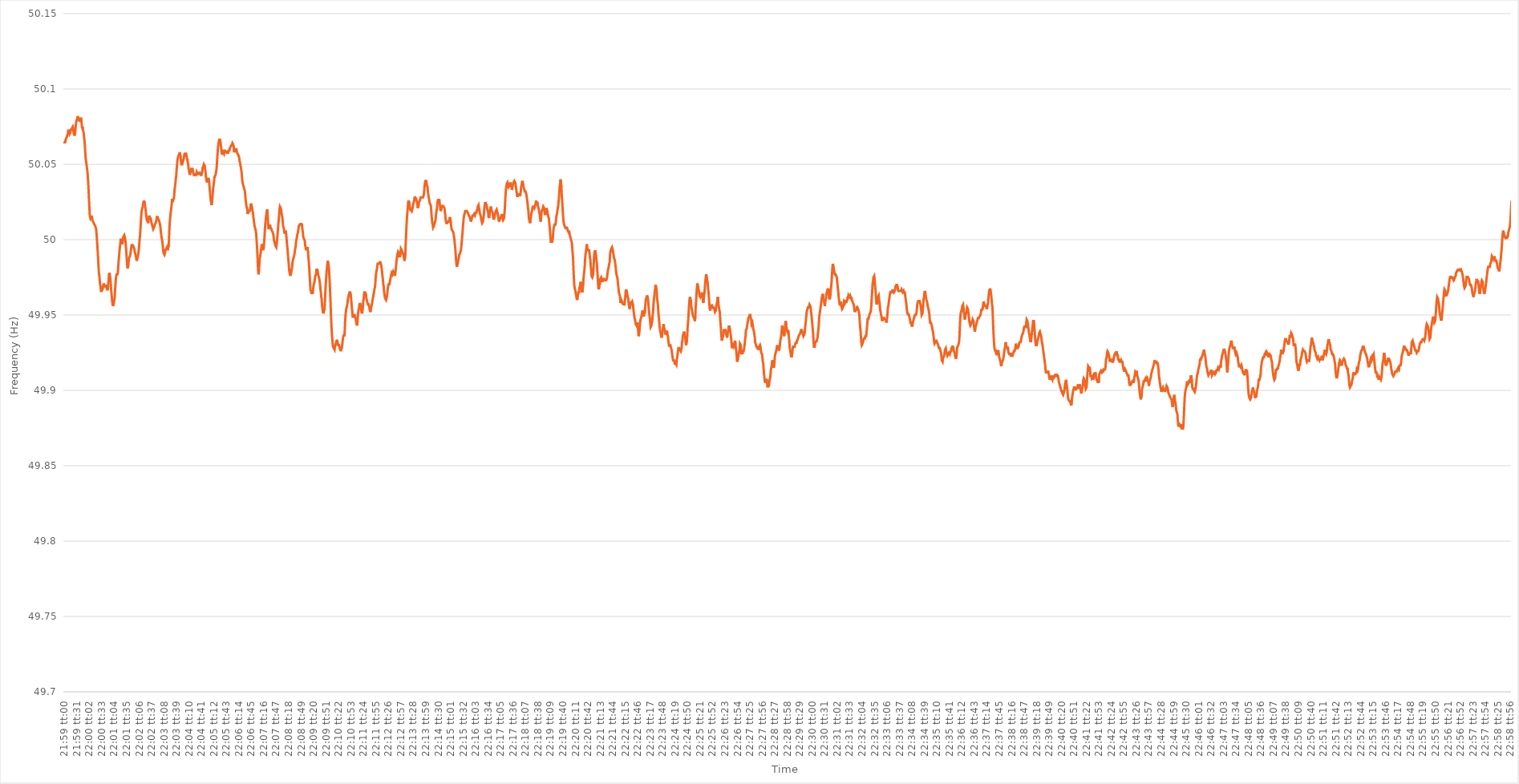
| Category | Series 0 |
|---|---|
| 0.9159722222222223 | 50.065 |
| 0.9159837962962962 | 50.064 |
| 0.9159953703703704 | 50.064 |
| 0.9160069444444444 | 50.066 |
| 0.9160185185185186 | 50.067 |
| 0.9160300925925925 | 50.067 |
| 0.9160416666666666 | 50.068 |
| 0.9160532407407408 | 50.069 |
| 0.9160648148148148 | 50.07 |
| 0.9160763888888889 | 50.071 |
| 0.9160879629629629 | 50.073 |
| 0.9160995370370371 | 50.07 |
| 0.9161111111111112 | 50.071 |
| 0.9161226851851851 | 50.07 |
| 0.9161342592592593 | 50.07 |
| 0.9161458333333333 | 50.071 |
| 0.9161574074074075 | 50.073 |
| 0.9161689814814814 | 50.073 |
| 0.9161805555555556 | 50.073 |
| 0.9161921296296297 | 50.074 |
| 0.9162037037037036 | 50.074 |
| 0.9162152777777778 | 50.075 |
| 0.9162268518518518 | 50.074 |
| 0.916238425925926 | 50.071 |
| 0.9162499999999999 | 50.07 |
| 0.916261574074074 | 50.069 |
| 0.9162731481481482 | 50.069 |
| 0.9162847222222222 | 50.071 |
| 0.9162962962962963 | 50.075 |
| 0.9163078703703703 | 50.077 |
| 0.9163194444444445 | 50.079 |
| 0.9163310185185186 | 50.079 |
| 0.9163425925925925 | 50.08 |
| 0.9163541666666667 | 50.082 |
| 0.9163657407407407 | 50.081 |
| 0.9163773148148149 | 50.08 |
| 0.9163888888888888 | 50.08 |
| 0.916400462962963 | 50.079 |
| 0.9164120370370371 | 50.079 |
| 0.916423611111111 | 50.079 |
| 0.9164351851851852 | 50.08 |
| 0.9164467592592592 | 50.081 |
| 0.9164583333333334 | 50.08 |
| 0.9164699074074073 | 50.077 |
| 0.9164814814814815 | 50.074 |
| 0.9164930555555556 | 50.075 |
| 0.9165046296296296 | 50.073 |
| 0.9165162037037037 | 50.072 |
| 0.9165277777777777 | 50.071 |
| 0.9165393518518519 | 50.068 |
| 0.916550925925926 | 50.066 |
| 0.9165625 | 50.062 |
| 0.9165740740740741 | 50.058 |
| 0.9165856481481481 | 50.054 |
| 0.9165972222222223 | 50.052 |
| 0.9166087962962962 | 50.05 |
| 0.9166203703703704 | 50.048 |
| 0.9166319444444445 | 50.046 |
| 0.9166435185185186 | 50.043 |
| 0.9166550925925926 | 50.039 |
| 0.9166666666666666 | 50.034 |
| 0.9166782407407408 | 50.028 |
| 0.9166898148148147 | 50.023 |
| 0.9167013888888889 | 50.017 |
| 0.916712962962963 | 50.015 |
| 0.916724537037037 | 50.014 |
| 0.9167361111111111 | 50.014 |
| 0.9167476851851851 | 50.015 |
| 0.9167592592592593 | 50.016 |
| 0.9167708333333334 | 50.014 |
| 0.9167824074074074 | 50.013 |
| 0.9167939814814815 | 50.012 |
| 0.9168055555555555 | 50.012 |
| 0.9168171296296297 | 50.011 |
| 0.9168287037037036 | 50.011 |
| 0.9168402777777778 | 50.01 |
| 0.9168518518518519 | 50.01 |
| 0.916863425925926 | 50.009 |
| 0.916875 | 50.008 |
| 0.916886574074074 | 50.007 |
| 0.9168981481481482 | 50.004 |
| 0.9169097222222221 | 50 |
| 0.9169212962962963 | 49.996 |
| 0.9169328703703704 | 49.992 |
| 0.9169444444444445 | 49.987 |
| 0.9169560185185185 | 49.982 |
| 0.9169675925925925 | 49.978 |
| 0.9169791666666667 | 49.976 |
| 0.9169907407407408 | 49.973 |
| 0.9170023148148148 | 49.97 |
| 0.9170138888888889 | 49.969 |
| 0.917025462962963 | 49.966 |
| 0.9170370370370371 | 49.966 |
| 0.917048611111111 | 49.966 |
| 0.9170601851851852 | 49.966 |
| 0.9170717592592593 | 49.967 |
| 0.9170833333333334 | 49.969 |
| 0.9170949074074074 | 49.97 |
| 0.9171064814814814 | 49.971 |
| 0.9171180555555556 | 49.97 |
| 0.9171296296296297 | 49.969 |
| 0.9171412037037037 | 49.969 |
| 0.9171527777777778 | 49.969 |
| 0.9171643518518519 | 49.97 |
| 0.9171759259259259 | 49.969 |
| 0.9171874999999999 | 49.968 |
| 0.9171990740740741 | 49.967 |
| 0.9172106481481482 | 49.967 |
| 0.9172222222222222 | 49.967 |
| 0.9172337962962963 | 49.97 |
| 0.9172453703703703 | 49.973 |
| 0.9172569444444445 | 49.977 |
| 0.9172685185185184 | 49.978 |
| 0.9172800925925926 | 49.977 |
| 0.9172916666666667 | 49.975 |
| 0.9173032407407408 | 49.972 |
| 0.9173148148148148 | 49.968 |
| 0.9173263888888888 | 49.965 |
| 0.917337962962963 | 49.962 |
| 0.9173495370370371 | 49.959 |
| 0.9173611111111111 | 49.957 |
| 0.9173726851851852 | 49.956 |
| 0.9173842592592593 | 49.956 |
| 0.9173958333333333 | 49.958 |
| 0.9174074074074073 | 49.96 |
| 0.9174189814814815 | 49.961 |
| 0.9174305555555556 | 49.966 |
| 0.9174421296296296 | 49.97 |
| 0.9174537037037037 | 49.974 |
| 0.9174652777777778 | 49.976 |
| 0.9174768518518519 | 49.977 |
| 0.9174884259259258 | 49.977 |
| 0.9175 | 49.977 |
| 0.9175115740740741 | 49.978 |
| 0.9175231481481482 | 49.982 |
| 0.9175347222222222 | 49.986 |
| 0.9175462962962962 | 49.989 |
| 0.9175578703703704 | 49.992 |
| 0.9175694444444445 | 49.995 |
| 0.9175810185185185 | 49.997 |
| 0.9175925925925926 | 50 |
| 0.9176041666666667 | 50 |
| 0.9176157407407407 | 50 |
| 0.9176273148148147 | 49.998 |
| 0.9176388888888889 | 49.997 |
| 0.917650462962963 | 49.997 |
| 0.917662037037037 | 50.001 |
| 0.9176736111111111 | 50.002 |
| 0.9176851851851852 | 50.002 |
| 0.9176967592592593 | 50.003 |
| 0.9177083333333332 | 50.002 |
| 0.9177199074074074 | 50.001 |
| 0.9177314814814815 | 49.999 |
| 0.9177430555555556 | 49.996 |
| 0.9177546296296296 | 49.992 |
| 0.9177662037037037 | 49.988 |
| 0.9177777777777778 | 49.984 |
| 0.917789351851852 | 49.981 |
| 0.9178009259259259 | 49.981 |
| 0.9178125 | 49.983 |
| 0.9178240740740741 | 49.986 |
| 0.9178356481481482 | 49.988 |
| 0.9178472222222221 | 49.988 |
| 0.9178587962962963 | 49.989 |
| 0.9178703703703704 | 49.99 |
| 0.9178819444444444 | 49.992 |
| 0.9178935185185185 | 49.994 |
| 0.9179050925925926 | 49.996 |
| 0.9179166666666667 | 49.997 |
| 0.9179282407407406 | 49.996 |
| 0.9179398148148148 | 49.996 |
| 0.9179513888888889 | 49.996 |
| 0.917962962962963 | 49.995 |
| 0.917974537037037 | 49.995 |
| 0.9179861111111111 | 49.994 |
| 0.9179976851851852 | 49.992 |
| 0.9180092592592594 | 49.991 |
| 0.9180208333333333 | 49.99 |
| 0.9180324074074074 | 49.989 |
| 0.9180439814814815 | 49.987 |
| 0.9180555555555556 | 49.986 |
| 0.9180671296296296 | 49.987 |
| 0.9180787037037037 | 49.988 |
| 0.9180902777777779 | 49.989 |
| 0.9181018518518518 | 49.991 |
| 0.9181134259259259 | 49.993 |
| 0.918125 | 49.996 |
| 0.9181365740740741 | 50 |
| 0.918148148148148 | 50.002 |
| 0.9181597222222222 | 50.006 |
| 0.9181712962962963 | 50.011 |
| 0.9181828703703704 | 50.015 |
| 0.9181944444444444 | 50.019 |
| 0.9182060185185185 | 50.02 |
| 0.9182175925925926 | 50.02 |
| 0.9182291666666668 | 50.022 |
| 0.9182407407407407 | 50.024 |
| 0.9182523148148148 | 50.025 |
| 0.9182638888888889 | 50.026 |
| 0.918275462962963 | 50.026 |
| 0.918287037037037 | 50.024 |
| 0.9182986111111111 | 50.022 |
| 0.9183101851851853 | 50.02 |
| 0.9183217592592593 | 50.017 |
| 0.9183333333333333 | 50.015 |
| 0.9183449074074074 | 50.013 |
| 0.9183564814814815 | 50.013 |
| 0.9183680555555555 | 50.012 |
| 0.9183796296296296 | 50.011 |
| 0.9183912037037038 | 50.012 |
| 0.9184027777777778 | 50.014 |
| 0.9184143518518518 | 50.016 |
| 0.9184259259259259 | 50.016 |
| 0.9184375 | 50.014 |
| 0.9184490740740742 | 50.014 |
| 0.9184606481481481 | 50.014 |
| 0.9184722222222222 | 50.012 |
| 0.9184837962962963 | 50.011 |
| 0.9184953703703704 | 50.011 |
| 0.9185069444444444 | 50.009 |
| 0.9185185185185185 | 50.009 |
| 0.9185300925925927 | 50.007 |
| 0.9185416666666667 | 50.007 |
| 0.9185532407407407 | 50.008 |
| 0.9185648148148148 | 50.009 |
| 0.9185763888888889 | 50.01 |
| 0.9185879629629629 | 50.01 |
| 0.918599537037037 | 50.011 |
| 0.9186111111111112 | 50.012 |
| 0.9186226851851852 | 50.013 |
| 0.9186342592592592 | 50.015 |
| 0.9186458333333333 | 50.015 |
| 0.9186574074074074 | 50.015 |
| 0.9186689814814816 | 50.014 |
| 0.9186805555555555 | 50.014 |
| 0.9186921296296297 | 50.013 |
| 0.9187037037037037 | 50.013 |
| 0.9187152777777778 | 50.011 |
| 0.9187268518518518 | 50.01 |
| 0.9187384259259259 | 50.008 |
| 0.9187500000000001 | 50.005 |
| 0.9187615740740741 | 50.003 |
| 0.9187731481481481 | 50.001 |
| 0.9187847222222222 | 50 |
| 0.9187962962962963 | 49.998 |
| 0.9188078703703703 | 49.995 |
| 0.9188194444444444 | 49.992 |
| 0.9188310185185186 | 49.991 |
| 0.9188425925925926 | 49.991 |
| 0.9188541666666666 | 49.99 |
| 0.9188657407407407 | 49.991 |
| 0.9188773148148148 | 49.993 |
| 0.918888888888889 | 49.993 |
| 0.9189004629629629 | 49.994 |
| 0.918912037037037 | 49.994 |
| 0.9189236111111111 | 49.995 |
| 0.9189351851851852 | 49.994 |
| 0.9189467592592592 | 49.993 |
| 0.9189583333333333 | 49.996 |
| 0.9189699074074075 | 49.995 |
| 0.9189814814814815 | 49.999 |
| 0.9189930555555555 | 50.006 |
| 0.9190046296296296 | 50.011 |
| 0.9190162037037037 | 50.014 |
| 0.9190277777777779 | 50.017 |
| 0.9190393518518518 | 50.019 |
| 0.919050925925926 | 50.021 |
| 0.9190625 | 50.024 |
| 0.919074074074074 | 50.027 |
| 0.9190856481481481 | 50.025 |
| 0.9190972222222222 | 50.026 |
| 0.9191087962962964 | 50.026 |
| 0.9191203703703703 | 50.027 |
| 0.9191319444444445 | 50.029 |
| 0.9191435185185185 | 50.033 |
| 0.9191550925925926 | 50.035 |
| 0.9191666666666666 | 50.037 |
| 0.9191782407407407 | 50.04 |
| 0.9191898148148149 | 50.042 |
| 0.9192013888888889 | 50.046 |
| 0.919212962962963 | 50.049 |
| 0.919224537037037 | 50.052 |
| 0.9192361111111111 | 50.054 |
| 0.9192476851851853 | 50.054 |
| 0.9192592592592592 | 50.056 |
| 0.9192708333333334 | 50.056 |
| 0.9192824074074074 | 50.057 |
| 0.9192939814814814 | 50.058 |
| 0.9193055555555555 | 50.058 |
| 0.9193171296296296 | 50.055 |
| 0.9193287037037038 | 50.052 |
| 0.9193402777777777 | 50.05 |
| 0.9193518518518519 | 50.05 |
| 0.9193634259259259 | 50.05 |
| 0.919375 | 50.051 |
| 0.919386574074074 | 50.051 |
| 0.9193981481481481 | 50.053 |
| 0.9194097222222223 | 50.054 |
| 0.9194212962962963 | 50.056 |
| 0.9194328703703704 | 50.057 |
| 0.9194444444444444 | 50.057 |
| 0.9194560185185185 | 50.057 |
| 0.9194675925925927 | 50.057 |
| 0.9194791666666666 | 50.057 |
| 0.9194907407407408 | 50.055 |
| 0.9195023148148148 | 50.054 |
| 0.9195138888888889 | 50.053 |
| 0.9195254629629629 | 50.051 |
| 0.919537037037037 | 50.05 |
| 0.9195486111111112 | 50.047 |
| 0.9195601851851851 | 50.046 |
| 0.9195717592592593 | 50.044 |
| 0.9195833333333333 | 50.043 |
| 0.9195949074074075 | 50.044 |
| 0.9196064814814814 | 50.045 |
| 0.9196180555555555 | 50.047 |
| 0.9196296296296297 | 50.047 |
| 0.9196412037037037 | 50.047 |
| 0.9196527777777778 | 50.047 |
| 0.9196643518518518 | 50.047 |
| 0.919675925925926 | 50.045 |
| 0.9196875000000001 | 50.044 |
| 0.919699074074074 | 50.043 |
| 0.9197106481481482 | 50.043 |
| 0.9197222222222222 | 50.043 |
| 0.9197337962962964 | 50.044 |
| 0.9197453703703703 | 50.043 |
| 0.9197569444444444 | 50.043 |
| 0.9197685185185186 | 50.043 |
| 0.9197800925925925 | 50.045 |
| 0.9197916666666667 | 50.045 |
| 0.9198032407407407 | 50.044 |
| 0.9198148148148149 | 50.043 |
| 0.9198263888888888 | 50.044 |
| 0.9198379629629629 | 50.044 |
| 0.9198495370370371 | 50.044 |
| 0.9198611111111111 | 50.045 |
| 0.9198726851851852 | 50.044 |
| 0.9198842592592592 | 50.044 |
| 0.9198958333333334 | 50.043 |
| 0.9199074074074075 | 50.043 |
| 0.9199189814814814 | 50.043 |
| 0.9199305555555556 | 50.044 |
| 0.9199421296296296 | 50.045 |
| 0.9199537037037038 | 50.048 |
| 0.9199652777777777 | 50.048 |
| 0.9199768518518519 | 50.049 |
| 0.919988425925926 | 50.05 |
| 0.9199999999999999 | 50.05 |
| 0.9200115740740741 | 50.049 |
| 0.9200231481481481 | 50.047 |
| 0.9200347222222223 | 50.045 |
| 0.9200462962962962 | 50.042 |
| 0.9200578703703703 | 50.04 |
| 0.9200694444444445 | 50.039 |
| 0.9200810185185185 | 50.038 |
| 0.9200925925925926 | 50.038 |
| 0.9201041666666666 | 50.04 |
| 0.9201157407407408 | 50.041 |
| 0.9201273148148149 | 50.041 |
| 0.9201388888888888 | 50.039 |
| 0.920150462962963 | 50.035 |
| 0.920162037037037 | 50.032 |
| 0.9201736111111112 | 50.029 |
| 0.9201851851851851 | 50.026 |
| 0.9201967592592593 | 50.025 |
| 0.9202083333333334 | 50.023 |
| 0.9202199074074073 | 50.024 |
| 0.9202314814814815 | 50.027 |
| 0.9202430555555555 | 50.031 |
| 0.9202546296296297 | 50.034 |
| 0.9202662037037036 | 50.036 |
| 0.9202777777777778 | 50.038 |
| 0.9202893518518519 | 50.041 |
| 0.9203009259259259 | 50.042 |
| 0.9203125 | 50.042 |
| 0.920324074074074 | 50.043 |
| 0.9203356481481482 | 50.043 |
| 0.9203472222222223 | 50.046 |
| 0.9203587962962962 | 50.049 |
| 0.9203703703703704 | 50.053 |
| 0.9203819444444444 | 50.057 |
| 0.9203935185185186 | 50.061 |
| 0.9204050925925925 | 50.063 |
| 0.9204166666666667 | 50.065 |
| 0.9204282407407408 | 50.066 |
| 0.9204398148148148 | 50.067 |
| 0.9204513888888889 | 50.067 |
| 0.9204629629629629 | 50.065 |
| 0.9204745370370371 | 50.063 |
| 0.920486111111111 | 50.061 |
| 0.9204976851851852 | 50.058 |
| 0.9205092592592593 | 50.057 |
| 0.9205208333333333 | 50.057 |
| 0.9205324074074074 | 50.057 |
| 0.9205439814814814 | 50.058 |
| 0.9205555555555556 | 50.058 |
| 0.9205671296296297 | 50.057 |
| 0.9205787037037036 | 50.059 |
| 0.9205902777777778 | 50.059 |
| 0.9206018518518518 | 50.059 |
| 0.920613425925926 | 50.059 |
| 0.9206249999999999 | 50.058 |
| 0.9206365740740741 | 50.058 |
| 0.9206481481481482 | 50.058 |
| 0.9206597222222223 | 50.059 |
| 0.9206712962962963 | 50.057 |
| 0.9206828703703703 | 50.057 |
| 0.9206944444444445 | 50.059 |
| 0.9207060185185184 | 50.059 |
| 0.9207175925925926 | 50.059 |
| 0.9207291666666667 | 50.06 |
| 0.9207407407407407 | 50.061 |
| 0.9207523148148148 | 50.061 |
| 0.9207638888888888 | 50.062 |
| 0.920775462962963 | 50.063 |
| 0.9207870370370371 | 50.062 |
| 0.920798611111111 | 50.063 |
| 0.9208101851851852 | 50.064 |
| 0.9208217592592592 | 50.064 |
| 0.9208333333333334 | 50.063 |
| 0.9208449074074073 | 50.062 |
| 0.9208564814814815 | 50.058 |
| 0.9208680555555556 | 50.059 |
| 0.9208796296296297 | 50.058 |
| 0.9208912037037037 | 50.058 |
| 0.9209027777777777 | 50.06 |
| 0.9209143518518519 | 50.06 |
| 0.920925925925926 | 50.06 |
| 0.9209375 | 50.058 |
| 0.9209490740740741 | 50.058 |
| 0.9209606481481482 | 50.057 |
| 0.9209722222222222 | 50.057 |
| 0.9209837962962962 | 50.056 |
| 0.9209953703703704 | 50.055 |
| 0.9210069444444445 | 50.054 |
| 0.9210185185185185 | 50.052 |
| 0.9210300925925926 | 50.051 |
| 0.9210416666666666 | 50.049 |
| 0.9210532407407408 | 50.048 |
| 0.9210648148148147 | 50.046 |
| 0.9210763888888889 | 50.044 |
| 0.921087962962963 | 50.041 |
| 0.9210995370370371 | 50.038 |
| 0.9211111111111111 | 50.037 |
| 0.9211226851851851 | 50.036 |
| 0.9211342592592593 | 50.035 |
| 0.9211458333333334 | 50.035 |
| 0.9211574074074074 | 50.033 |
| 0.9211689814814815 | 50.032 |
| 0.9211805555555556 | 50.029 |
| 0.9211921296296296 | 50.026 |
| 0.9212037037037036 | 50.024 |
| 0.9212152777777778 | 50.022 |
| 0.9212268518518519 | 50.021 |
| 0.9212384259259259 | 50.02 |
| 0.92125 | 50.017 |
| 0.921261574074074 | 50.019 |
| 0.9212731481481482 | 50.019 |
| 0.9212847222222221 | 50.019 |
| 0.9212962962962963 | 50.019 |
| 0.9213078703703704 | 50.019 |
| 0.9213194444444445 | 50.02 |
| 0.9213310185185185 | 50.022 |
| 0.9213425925925925 | 50.024 |
| 0.9213541666666667 | 50.023 |
| 0.9213657407407408 | 50.023 |
| 0.9213773148148148 | 50.021 |
| 0.9213888888888889 | 50.019 |
| 0.921400462962963 | 50.018 |
| 0.921412037037037 | 50.015 |
| 0.921423611111111 | 50.013 |
| 0.9214351851851852 | 50.011 |
| 0.9214467592592593 | 50.009 |
| 0.9214583333333333 | 50.008 |
| 0.9214699074074074 | 50.007 |
| 0.9214814814814815 | 50.006 |
| 0.9214930555555556 | 50.004 |
| 0.9215046296296295 | 50 |
| 0.9215162037037037 | 49.996 |
| 0.9215277777777778 | 49.991 |
| 0.9215393518518519 | 49.984 |
| 0.9215509259259259 | 49.979 |
| 0.9215625 | 49.977 |
| 0.9215740740740741 | 49.98 |
| 0.9215856481481483 | 49.984 |
| 0.9215972222222222 | 49.988 |
| 0.9216087962962963 | 49.989 |
| 0.9216203703703704 | 49.991 |
| 0.9216319444444445 | 49.991 |
| 0.9216435185185184 | 49.995 |
| 0.9216550925925926 | 49.997 |
| 0.9216666666666667 | 49.997 |
| 0.9216782407407407 | 49.995 |
| 0.9216898148148148 | 49.993 |
| 0.9217013888888889 | 49.993 |
| 0.921712962962963 | 49.995 |
| 0.9217245370370369 | 49.999 |
| 0.9217361111111111 | 50.003 |
| 0.9217476851851852 | 50.008 |
| 0.9217592592592593 | 50.011 |
| 0.9217708333333333 | 50.014 |
| 0.9217824074074074 | 50.016 |
| 0.9217939814814815 | 50.018 |
| 0.9218055555555557 | 50.02 |
| 0.9218171296296296 | 50.019 |
| 0.9218287037037037 | 50.014 |
| 0.9218402777777778 | 50.01 |
| 0.9218518518518519 | 50.007 |
| 0.9218634259259259 | 50.008 |
| 0.921875 | 50.008 |
| 0.9218865740740741 | 50.01 |
| 0.9218981481481481 | 50.009 |
| 0.9219097222222222 | 50.008 |
| 0.9219212962962963 | 50.008 |
| 0.9219328703703704 | 50.007 |
| 0.9219444444444443 | 50.006 |
| 0.9219560185185185 | 50.006 |
| 0.9219675925925926 | 50.005 |
| 0.9219791666666667 | 50.004 |
| 0.9219907407407407 | 50.003 |
| 0.9220023148148148 | 50 |
| 0.9220138888888889 | 49.999 |
| 0.9220254629629631 | 49.999 |
| 0.922037037037037 | 49.997 |
| 0.9220486111111111 | 49.996 |
| 0.9220601851851852 | 49.996 |
| 0.9220717592592593 | 49.995 |
| 0.9220833333333333 | 49.997 |
| 0.9220949074074074 | 50 |
| 0.9221064814814816 | 50.003 |
| 0.9221180555555555 | 50.006 |
| 0.9221296296296296 | 50.01 |
| 0.9221412037037037 | 50.013 |
| 0.9221527777777778 | 50.016 |
| 0.9221643518518517 | 50.02 |
| 0.9221759259259259 | 50.022 |
| 0.9221875 | 50.022 |
| 0.9221990740740741 | 50.021 |
| 0.9222106481481481 | 50.02 |
| 0.9222222222222222 | 50.018 |
| 0.9222337962962963 | 50.016 |
| 0.9222453703703705 | 50.015 |
| 0.9222569444444444 | 50.012 |
| 0.9222685185185185 | 50.009 |
| 0.9222800925925926 | 50.008 |
| 0.9222916666666667 | 50.007 |
| 0.9223032407407407 | 50.005 |
| 0.9223148148148148 | 50.004 |
| 0.922326388888889 | 50.005 |
| 0.922337962962963 | 50.006 |
| 0.922349537037037 | 50.005 |
| 0.9223611111111111 | 50.003 |
| 0.9223726851851852 | 49.999 |
| 0.9223842592592592 | 49.996 |
| 0.9223958333333333 | 49.994 |
| 0.9224074074074075 | 49.99 |
| 0.9224189814814815 | 49.987 |
| 0.9224305555555555 | 49.984 |
| 0.9224421296296296 | 49.98 |
| 0.9224537037037037 | 49.978 |
| 0.9224652777777779 | 49.977 |
| 0.9224768518518518 | 49.976 |
| 0.922488425925926 | 49.977 |
| 0.9225 | 49.978 |
| 0.9225115740740741 | 49.98 |
| 0.9225231481481481 | 49.981 |
| 0.9225347222222222 | 49.984 |
| 0.9225462962962964 | 49.986 |
| 0.9225578703703704 | 49.987 |
| 0.9225694444444444 | 49.987 |
| 0.9225810185185185 | 49.989 |
| 0.9225925925925926 | 49.99 |
| 0.9226041666666666 | 49.992 |
| 0.9226157407407407 | 49.994 |
| 0.9226273148148149 | 49.995 |
| 0.9226388888888889 | 49.998 |
| 0.9226504629629629 | 50 |
| 0.922662037037037 | 50.001 |
| 0.9226736111111111 | 50.003 |
| 0.9226851851851853 | 50.003 |
| 0.9226967592592592 | 50.005 |
| 0.9227083333333334 | 50.007 |
| 0.9227199074074074 | 50.009 |
| 0.9227314814814815 | 50.009 |
| 0.9227430555555555 | 50.01 |
| 0.9227546296296296 | 50.01 |
| 0.9227662037037038 | 50.01 |
| 0.9227777777777778 | 50.011 |
| 0.9227893518518518 | 50.01 |
| 0.9228009259259259 | 50.01 |
| 0.9228125 | 50.01 |
| 0.922824074074074 | 50.007 |
| 0.9228356481481481 | 50.005 |
| 0.9228472222222223 | 50.002 |
| 0.9228587962962963 | 50.001 |
| 0.9228703703703703 | 50.001 |
| 0.9228819444444444 | 50 |
| 0.9228935185185185 | 49.999 |
| 0.9229050925925927 | 49.996 |
| 0.9229166666666666 | 49.995 |
| 0.9229282407407408 | 49.993 |
| 0.9229398148148148 | 49.995 |
| 0.922951388888889 | 49.994 |
| 0.9229629629629629 | 49.995 |
| 0.922974537037037 | 49.994 |
| 0.9229861111111112 | 49.992 |
| 0.9229976851851852 | 49.988 |
| 0.9230092592592593 | 49.985 |
| 0.9230208333333333 | 49.981 |
| 0.9230324074074074 | 49.976 |
| 0.9230439814814816 | 49.972 |
| 0.9230555555555555 | 49.967 |
| 0.9230671296296297 | 49.966 |
| 0.9230787037037037 | 49.965 |
| 0.9230902777777777 | 49.964 |
| 0.9231018518518518 | 49.965 |
| 0.9231134259259259 | 49.964 |
| 0.9231250000000001 | 49.966 |
| 0.923136574074074 | 49.968 |
| 0.9231481481481482 | 49.97 |
| 0.9231597222222222 | 49.97 |
| 0.9231712962962964 | 49.972 |
| 0.9231828703703703 | 49.974 |
| 0.9231944444444444 | 49.976 |
| 0.9232060185185186 | 49.976 |
| 0.9232175925925926 | 49.977 |
| 0.9232291666666667 | 49.98 |
| 0.9232407407407407 | 49.98 |
| 0.9232523148148148 | 49.98 |
| 0.923263888888889 | 49.979 |
| 0.9232754629629629 | 49.977 |
| 0.9232870370370371 | 49.977 |
| 0.9232986111111111 | 49.975 |
| 0.9233101851851852 | 49.974 |
| 0.9233217592592592 | 49.972 |
| 0.9233333333333333 | 49.97 |
| 0.9233449074074075 | 49.967 |
| 0.9233564814814814 | 49.965 |
| 0.9233680555555556 | 49.962 |
| 0.9233796296296296 | 49.96 |
| 0.9233912037037038 | 49.956 |
| 0.9234027777777777 | 49.954 |
| 0.9234143518518518 | 49.952 |
| 0.923425925925926 | 49.951 |
| 0.9234375 | 49.952 |
| 0.9234490740740741 | 49.952 |
| 0.9234606481481481 | 49.954 |
| 0.9234722222222222 | 49.959 |
| 0.9234837962962964 | 49.965 |
| 0.9234953703703703 | 49.97 |
| 0.9235069444444445 | 49.974 |
| 0.9235185185185185 | 49.978 |
| 0.9235300925925927 | 49.981 |
| 0.9235416666666666 | 49.984 |
| 0.9235532407407407 | 49.986 |
| 0.9235648148148149 | 49.986 |
| 0.9235763888888888 | 49.983 |
| 0.923587962962963 | 49.981 |
| 0.923599537037037 | 49.976 |
| 0.9236111111111112 | 49.971 |
| 0.9236226851851851 | 49.965 |
| 0.9236342592592592 | 49.958 |
| 0.9236458333333334 | 49.95 |
| 0.9236574074074074 | 49.944 |
| 0.9236689814814815 | 49.939 |
| 0.9236805555555555 | 49.935 |
| 0.9236921296296297 | 49.932 |
| 0.9237037037037038 | 49.929 |
| 0.9237152777777777 | 49.929 |
| 0.9237268518518519 | 49.928 |
| 0.9237384259259259 | 49.928 |
| 0.9237500000000001 | 49.927 |
| 0.923761574074074 | 49.929 |
| 0.9237731481481481 | 49.93 |
| 0.9237847222222223 | 49.931 |
| 0.9237962962962962 | 49.932 |
| 0.9238078703703704 | 49.933 |
| 0.9238194444444444 | 49.933 |
| 0.9238310185185186 | 49.933 |
| 0.9238425925925925 | 49.931 |
| 0.9238541666666666 | 49.93 |
| 0.9238657407407408 | 49.93 |
| 0.9238773148148148 | 49.93 |
| 0.9238888888888889 | 49.929 |
| 0.9239004629629629 | 49.928 |
| 0.9239120370370371 | 49.928 |
| 0.9239236111111112 | 49.926 |
| 0.9239351851851851 | 49.927 |
| 0.9239467592592593 | 49.927 |
| 0.9239583333333333 | 49.928 |
| 0.9239699074074075 | 49.93 |
| 0.9239814814814814 | 49.933 |
| 0.9239930555555556 | 49.935 |
| 0.9240046296296297 | 49.936 |
| 0.9240162037037036 | 49.937 |
| 0.9240277777777778 | 49.936 |
| 0.9240393518518518 | 49.938 |
| 0.924050925925926 | 49.944 |
| 0.9240624999999999 | 49.949 |
| 0.924074074074074 | 49.952 |
| 0.9240856481481482 | 49.954 |
| 0.9240972222222222 | 49.955 |
| 0.9241087962962963 | 49.956 |
| 0.9241203703703703 | 49.958 |
| 0.9241319444444445 | 49.96 |
| 0.9241435185185186 | 49.962 |
| 0.9241550925925925 | 49.963 |
| 0.9241666666666667 | 49.964 |
| 0.9241782407407407 | 49.965 |
| 0.9241898148148149 | 49.965 |
| 0.9242013888888888 | 49.965 |
| 0.924212962962963 | 49.964 |
| 0.9242245370370371 | 49.961 |
| 0.9242361111111111 | 49.958 |
| 0.9242476851851852 | 49.955 |
| 0.9242592592592592 | 49.952 |
| 0.9242708333333334 | 49.949 |
| 0.9242824074074073 | 49.949 |
| 0.9242939814814815 | 49.949 |
| 0.9243055555555556 | 49.95 |
| 0.9243171296296296 | 49.95 |
| 0.9243287037037037 | 49.95 |
| 0.9243402777777777 | 49.949 |
| 0.9243518518518519 | 49.949 |
| 0.924363425925926 | 49.947 |
| 0.924375 | 49.945 |
| 0.9243865740740741 | 49.944 |
| 0.9243981481481481 | 49.943 |
| 0.9244097222222223 | 49.946 |
| 0.9244212962962962 | 49.95 |
| 0.9244328703703704 | 49.952 |
| 0.9244444444444445 | 49.954 |
| 0.9244560185185186 | 49.955 |
| 0.9244675925925926 | 49.957 |
| 0.9244791666666666 | 49.958 |
| 0.9244907407407408 | 49.958 |
| 0.9245023148148147 | 49.956 |
| 0.9245138888888889 | 49.954 |
| 0.924525462962963 | 49.952 |
| 0.924537037037037 | 49.951 |
| 0.9245486111111111 | 49.952 |
| 0.9245601851851851 | 49.954 |
| 0.9245717592592593 | 49.958 |
| 0.9245833333333334 | 49.96 |
| 0.9245949074074074 | 49.963 |
| 0.9246064814814815 | 49.965 |
| 0.9246180555555555 | 49.965 |
| 0.9246296296296297 | 49.965 |
| 0.9246412037037036 | 49.965 |
| 0.9246527777777778 | 49.964 |
| 0.9246643518518519 | 49.961 |
| 0.924675925925926 | 49.96 |
| 0.9246875 | 49.959 |
| 0.924699074074074 | 49.958 |
| 0.9247106481481482 | 49.957 |
| 0.9247222222222221 | 49.957 |
| 0.9247337962962963 | 49.957 |
| 0.9247453703703704 | 49.956 |
| 0.9247569444444445 | 49.954 |
| 0.9247685185185185 | 49.953 |
| 0.9247800925925925 | 49.952 |
| 0.9247916666666667 | 49.954 |
| 0.9248032407407408 | 49.954 |
| 0.9248148148148148 | 49.956 |
| 0.9248263888888889 | 49.956 |
| 0.924837962962963 | 49.959 |
| 0.9248495370370371 | 49.961 |
| 0.924861111111111 | 49.962 |
| 0.9248726851851852 | 49.964 |
| 0.9248842592592593 | 49.965 |
| 0.9248958333333334 | 49.967 |
| 0.9249074074074074 | 49.968 |
| 0.9249189814814814 | 49.97 |
| 0.9249305555555556 | 49.974 |
| 0.9249421296296297 | 49.977 |
| 0.9249537037037037 | 49.979 |
| 0.9249652777777778 | 49.98 |
| 0.9249768518518519 | 49.982 |
| 0.9249884259259259 | 49.984 |
| 0.9249999999999999 | 49.984 |
| 0.9250115740740741 | 49.984 |
| 0.9250231481481482 | 49.984 |
| 0.9250347222222222 | 49.984 |
| 0.9250462962962963 | 49.985 |
| 0.9250578703703703 | 49.985 |
| 0.9250694444444445 | 49.985 |
| 0.9250810185185184 | 49.985 |
| 0.9250925925925926 | 49.983 |
| 0.9251041666666667 | 49.981 |
| 0.9251157407407408 | 49.979 |
| 0.9251273148148148 | 49.976 |
| 0.9251388888888888 | 49.974 |
| 0.925150462962963 | 49.971 |
| 0.9251620370370371 | 49.969 |
| 0.9251736111111111 | 49.966 |
| 0.9251851851851852 | 49.964 |
| 0.9251967592592593 | 49.962 |
| 0.9252083333333333 | 49.961 |
| 0.9252199074074073 | 49.961 |
| 0.9252314814814815 | 49.96 |
| 0.9252430555555556 | 49.96 |
| 0.9252546296296296 | 49.962 |
| 0.9252662037037037 | 49.964 |
| 0.9252777777777778 | 49.967 |
| 0.9252893518518519 | 49.969 |
| 0.9253009259259258 | 49.97 |
| 0.9253125 | 49.971 |
| 0.9253240740740741 | 49.97 |
| 0.9253356481481482 | 49.971 |
| 0.9253472222222222 | 49.973 |
| 0.9253587962962962 | 49.974 |
| 0.9253703703703704 | 49.976 |
| 0.9253819444444445 | 49.977 |
| 0.9253935185185185 | 49.978 |
| 0.9254050925925926 | 49.978 |
| 0.9254166666666667 | 49.977 |
| 0.9254282407407407 | 49.978 |
| 0.9254398148148147 | 49.979 |
| 0.9254513888888889 | 49.979 |
| 0.925462962962963 | 49.978 |
| 0.925474537037037 | 49.977 |
| 0.9254861111111111 | 49.976 |
| 0.9254976851851852 | 49.978 |
| 0.9255092592592593 | 49.98 |
| 0.9255208333333332 | 49.983 |
| 0.9255324074074074 | 49.986 |
| 0.9255439814814815 | 49.988 |
| 0.9255555555555556 | 49.99 |
| 0.9255671296296296 | 49.991 |
| 0.9255787037037037 | 49.992 |
| 0.9255902777777778 | 49.992 |
| 0.925601851851852 | 49.991 |
| 0.9256134259259259 | 49.989 |
| 0.925625 | 49.989 |
| 0.9256365740740741 | 49.989 |
| 0.9256481481481482 | 49.991 |
| 0.9256597222222221 | 49.994 |
| 0.9256712962962963 | 49.994 |
| 0.9256828703703704 | 49.993 |
| 0.9256944444444444 | 49.992 |
| 0.9257060185185185 | 49.992 |
| 0.9257175925925926 | 49.991 |
| 0.9257291666666667 | 49.99 |
| 0.9257407407407406 | 49.989 |
| 0.9257523148148148 | 49.987 |
| 0.9257638888888889 | 49.986 |
| 0.925775462962963 | 49.986 |
| 0.925787037037037 | 49.991 |
| 0.9257986111111111 | 49.998 |
| 0.9258101851851852 | 50.004 |
| 0.9258217592592594 | 50.01 |
| 0.9258333333333333 | 50.015 |
| 0.9258449074074074 | 50.018 |
| 0.9258564814814815 | 50.021 |
| 0.9258680555555556 | 50.025 |
| 0.9258796296296296 | 50.026 |
| 0.9258912037037037 | 50.026 |
| 0.9259027777777779 | 50.024 |
| 0.9259143518518518 | 50.022 |
| 0.9259259259259259 | 50.02 |
| 0.9259375 | 50.02 |
| 0.9259490740740741 | 50.02 |
| 0.925960648148148 | 50.02 |
| 0.9259722222222222 | 50.019 |
| 0.9259837962962963 | 50.019 |
| 0.9259953703703704 | 50.021 |
| 0.9260069444444444 | 50.023 |
| 0.9260185185185185 | 50.024 |
| 0.9260300925925926 | 50.025 |
| 0.9260416666666668 | 50.026 |
| 0.9260532407407407 | 50.028 |
| 0.9260648148148148 | 50.028 |
| 0.9260763888888889 | 50.028 |
| 0.926087962962963 | 50.028 |
| 0.926099537037037 | 50.027 |
| 0.9261111111111111 | 50.027 |
| 0.9261226851851853 | 50.025 |
| 0.9261342592592593 | 50.023 |
| 0.9261458333333333 | 50.021 |
| 0.9261574074074074 | 50.021 |
| 0.9261689814814815 | 50.023 |
| 0.9261805555555555 | 50.025 |
| 0.9261921296296296 | 50.025 |
| 0.9262037037037038 | 50.026 |
| 0.9262152777777778 | 50.027 |
| 0.9262268518518518 | 50.028 |
| 0.9262384259259259 | 50.028 |
| 0.92625 | 50.028 |
| 0.9262615740740742 | 50.028 |
| 0.9262731481481481 | 50.028 |
| 0.9262847222222222 | 50.028 |
| 0.9262962962962963 | 50.028 |
| 0.9263078703703704 | 50.028 |
| 0.9263194444444444 | 50.03 |
| 0.9263310185185185 | 50.033 |
| 0.9263425925925927 | 50.036 |
| 0.9263541666666667 | 50.038 |
| 0.9263657407407407 | 50.039 |
| 0.9263773148148148 | 50.039 |
| 0.9263888888888889 | 50.039 |
| 0.9264004629629629 | 50.037 |
| 0.926412037037037 | 50.037 |
| 0.9264236111111112 | 50.035 |
| 0.9264351851851852 | 50.032 |
| 0.9264467592592592 | 50.03 |
| 0.9264583333333333 | 50.028 |
| 0.9264699074074074 | 50.027 |
| 0.9264814814814816 | 50.025 |
| 0.9264930555555555 | 50.024 |
| 0.9265046296296297 | 50.024 |
| 0.9265162037037037 | 50.023 |
| 0.9265277777777778 | 50.021 |
| 0.9265393518518518 | 50.017 |
| 0.9265509259259259 | 50.014 |
| 0.9265625000000001 | 50.011 |
| 0.9265740740740741 | 50.01 |
| 0.9265856481481481 | 50.008 |
| 0.9265972222222222 | 50.008 |
| 0.9266087962962963 | 50.009 |
| 0.9266203703703703 | 50.01 |
| 0.9266319444444444 | 50.011 |
| 0.9266435185185186 | 50.012 |
| 0.9266550925925926 | 50.013 |
| 0.9266666666666666 | 50.016 |
| 0.9266782407407407 | 50.018 |
| 0.9266898148148148 | 50.02 |
| 0.926701388888889 | 50.022 |
| 0.9267129629629629 | 50.025 |
| 0.926724537037037 | 50.026 |
| 0.9267361111111111 | 50.027 |
| 0.9267476851851852 | 50.026 |
| 0.9267592592592592 | 50.027 |
| 0.9267708333333333 | 50.024 |
| 0.9267824074074075 | 50.023 |
| 0.9267939814814815 | 50.02 |
| 0.9268055555555555 | 50.019 |
| 0.9268171296296296 | 50.02 |
| 0.9268287037037037 | 50.021 |
| 0.9268402777777779 | 50.022 |
| 0.9268518518518518 | 50.023 |
| 0.926863425925926 | 50.022 |
| 0.926875 | 50.022 |
| 0.926886574074074 | 50.022 |
| 0.9268981481481481 | 50.022 |
| 0.9269097222222222 | 50.021 |
| 0.9269212962962964 | 50.019 |
| 0.9269328703703703 | 50.017 |
| 0.9269444444444445 | 50.014 |
| 0.9269560185185185 | 50.012 |
| 0.9269675925925926 | 50.011 |
| 0.9269791666666666 | 50.011 |
| 0.9269907407407407 | 50.011 |
| 0.9270023148148149 | 50.012 |
| 0.9270138888888889 | 50.012 |
| 0.927025462962963 | 50.012 |
| 0.927037037037037 | 50.012 |
| 0.9270486111111111 | 50.013 |
| 0.9270601851851853 | 50.014 |
| 0.9270717592592592 | 50.015 |
| 0.9270833333333334 | 50.015 |
| 0.9270949074074074 | 50.011 |
| 0.9271064814814814 | 50.009 |
| 0.9271180555555555 | 50.007 |
| 0.9271296296296296 | 50.007 |
| 0.9271412037037038 | 50.006 |
| 0.9271527777777777 | 50.006 |
| 0.9271643518518519 | 50.005 |
| 0.9271759259259259 | 50.004 |
| 0.9271875 | 50.002 |
| 0.927199074074074 | 50 |
| 0.9272106481481481 | 49.997 |
| 0.9272222222222223 | 49.995 |
| 0.9272337962962963 | 49.991 |
| 0.9272453703703704 | 49.987 |
| 0.9272569444444444 | 49.984 |
| 0.9272685185185185 | 49.982 |
| 0.9272800925925927 | 49.983 |
| 0.9272916666666666 | 49.984 |
| 0.9273032407407408 | 49.985 |
| 0.9273148148148148 | 49.987 |
| 0.9273263888888889 | 49.988 |
| 0.9273379629629629 | 49.99 |
| 0.927349537037037 | 49.99 |
| 0.9273611111111112 | 49.991 |
| 0.9273726851851851 | 49.991 |
| 0.9273842592592593 | 49.993 |
| 0.9273958333333333 | 49.995 |
| 0.9274074074074075 | 49.998 |
| 0.9274189814814814 | 50.001 |
| 0.9274305555555555 | 50.004 |
| 0.9274421296296297 | 50.008 |
| 0.9274537037037037 | 50.011 |
| 0.9274652777777778 | 50.014 |
| 0.9274768518518518 | 50.016 |
| 0.927488425925926 | 50.017 |
| 0.9275000000000001 | 50.018 |
| 0.927511574074074 | 50.019 |
| 0.9275231481481482 | 50.019 |
| 0.9275347222222222 | 50.019 |
| 0.9275462962962964 | 50.019 |
| 0.9275578703703703 | 50.019 |
| 0.9275694444444444 | 50.019 |
| 0.9275810185185186 | 50.018 |
| 0.9275925925925925 | 50.018 |
| 0.9276041666666667 | 50.017 |
| 0.9276157407407407 | 50.016 |
| 0.9276273148148149 | 50.016 |
| 0.9276388888888888 | 50.015 |
| 0.9276504629629629 | 50.014 |
| 0.9276620370370371 | 50.013 |
| 0.9276736111111111 | 50.012 |
| 0.9276851851851852 | 50.012 |
| 0.9276967592592592 | 50.014 |
| 0.9277083333333334 | 50.015 |
| 0.9277199074074075 | 50.016 |
| 0.9277314814814814 | 50.016 |
| 0.9277430555555556 | 50.016 |
| 0.9277546296296296 | 50.016 |
| 0.9277662037037038 | 50.017 |
| 0.9277777777777777 | 50.017 |
| 0.9277893518518519 | 50.016 |
| 0.927800925925926 | 50.017 |
| 0.9278124999999999 | 50.018 |
| 0.9278240740740741 | 50.018 |
| 0.9278356481481481 | 50.018 |
| 0.9278472222222223 | 50.02 |
| 0.9278587962962962 | 50.019 |
| 0.9278703703703703 | 50.022 |
| 0.9278819444444445 | 50.022 |
| 0.9278935185185185 | 50.023 |
| 0.9279050925925926 | 50.021 |
| 0.9279166666666666 | 50.02 |
| 0.9279282407407408 | 50.018 |
| 0.9279398148148149 | 50.017 |
| 0.9279513888888888 | 50.016 |
| 0.927962962962963 | 50.015 |
| 0.927974537037037 | 50.013 |
| 0.9279861111111112 | 50.012 |
| 0.9279976851851851 | 50.011 |
| 0.9280092592592593 | 50.011 |
| 0.9280208333333334 | 50.012 |
| 0.9280324074074073 | 50.014 |
| 0.9280439814814815 | 50.016 |
| 0.9280555555555555 | 50.019 |
| 0.9280671296296297 | 50.022 |
| 0.9280787037037036 | 50.024 |
| 0.9280902777777778 | 50.025 |
| 0.9281018518518519 | 50.024 |
| 0.9281134259259259 | 50.024 |
| 0.928125 | 50.023 |
| 0.928136574074074 | 50.021 |
| 0.9281481481481482 | 50.021 |
| 0.9281597222222223 | 50.019 |
| 0.9281712962962962 | 50.018 |
| 0.9281828703703704 | 50.015 |
| 0.9281944444444444 | 50.015 |
| 0.9282060185185186 | 50.015 |
| 0.9282175925925925 | 50.018 |
| 0.9282291666666667 | 50.02 |
| 0.9282407407407408 | 50.022 |
| 0.9282523148148148 | 50.022 |
| 0.9282638888888889 | 50.02 |
| 0.9282754629629629 | 50.019 |
| 0.9282870370370371 | 50.019 |
| 0.928298611111111 | 50.018 |
| 0.9283101851851852 | 50.016 |
| 0.9283217592592593 | 50.014 |
| 0.9283333333333333 | 50.014 |
| 0.9283449074074074 | 50.014 |
| 0.9283564814814814 | 50.015 |
| 0.9283680555555556 | 50.017 |
| 0.9283796296296297 | 50.018 |
| 0.9283912037037036 | 50.019 |
| 0.9284027777777778 | 50.019 |
| 0.9284143518518518 | 50.02 |
| 0.928425925925926 | 50.019 |
| 0.9284374999999999 | 50.019 |
| 0.9284490740740741 | 50.017 |
| 0.9284606481481482 | 50.015 |
| 0.9284722222222223 | 50.013 |
| 0.9284837962962963 | 50.012 |
| 0.9284953703703703 | 50.013 |
| 0.9285069444444445 | 50.013 |
| 0.9285185185185184 | 50.014 |
| 0.9285300925925926 | 50.015 |
| 0.9285416666666667 | 50.015 |
| 0.9285532407407407 | 50.016 |
| 0.9285648148148148 | 50.017 |
| 0.9285763888888888 | 50.016 |
| 0.928587962962963 | 50.014 |
| 0.9285995370370371 | 50.013 |
| 0.928611111111111 | 50.013 |
| 0.9286226851851852 | 50.014 |
| 0.9286342592592592 | 50.016 |
| 0.9286458333333334 | 50.019 |
| 0.9286574074074073 | 50.024 |
| 0.9286689814814815 | 50.029 |
| 0.9286805555555556 | 50.033 |
| 0.9286921296296297 | 50.035 |
| 0.9287037037037037 | 50.037 |
| 0.9287152777777777 | 50.037 |
| 0.9287268518518519 | 50.038 |
| 0.928738425925926 | 50.037 |
| 0.92875 | 50.037 |
| 0.9287615740740741 | 50.035 |
| 0.9287731481481482 | 50.035 |
| 0.9287847222222222 | 50.036 |
| 0.9287962962962962 | 50.037 |
| 0.9288078703703704 | 50.038 |
| 0.9288194444444445 | 50.038 |
| 0.9288310185185185 | 50.036 |
| 0.9288425925925926 | 50.035 |
| 0.9288541666666666 | 50.033 |
| 0.9288657407407408 | 50.034 |
| 0.9288773148148147 | 50.036 |
| 0.9288888888888889 | 50.037 |
| 0.928900462962963 | 50.038 |
| 0.9289120370370371 | 50.038 |
| 0.9289236111111111 | 50.039 |
| 0.9289351851851851 | 50.039 |
| 0.9289467592592593 | 50.038 |
| 0.9289583333333334 | 50.037 |
| 0.9289699074074074 | 50.035 |
| 0.9289814814814815 | 50.033 |
| 0.9289930555555556 | 50.031 |
| 0.9290046296296296 | 50.029 |
| 0.9290162037037036 | 50.029 |
| 0.9290277777777778 | 50.029 |
| 0.9290393518518519 | 50.029 |
| 0.9290509259259259 | 50.03 |
| 0.9290625 | 50.03 |
| 0.929074074074074 | 50.03 |
| 0.9290856481481482 | 50.029 |
| 0.9290972222222221 | 50.03 |
| 0.9291087962962963 | 50.032 |
| 0.9291203703703704 | 50.035 |
| 0.9291319444444445 | 50.036 |
| 0.9291435185185185 | 50.038 |
| 0.9291550925925925 | 50.039 |
| 0.9291666666666667 | 50.038 |
| 0.9291782407407408 | 50.037 |
| 0.9291898148148148 | 50.035 |
| 0.9292013888888889 | 50.034 |
| 0.929212962962963 | 50.033 |
| 0.929224537037037 | 50.032 |
| 0.929236111111111 | 50.032 |
| 0.9292476851851852 | 50.032 |
| 0.9292592592592593 | 50.032 |
| 0.9292708333333333 | 50.03 |
| 0.9292824074074074 | 50.028 |
| 0.9292939814814815 | 50.026 |
| 0.9293055555555556 | 50.024 |
| 0.9293171296296295 | 50.021 |
| 0.9293287037037037 | 50.019 |
| 0.9293402777777778 | 50.015 |
| 0.9293518518518519 | 50.013 |
| 0.9293634259259259 | 50.012 |
| 0.929375 | 50.011 |
| 0.9293865740740741 | 50.013 |
| 0.9293981481481483 | 50.015 |
| 0.9294097222222222 | 50.017 |
| 0.9294212962962963 | 50.017 |
| 0.9294328703703704 | 50.019 |
| 0.9294444444444444 | 50.021 |
| 0.9294560185185184 | 50.022 |
| 0.9294675925925926 | 50.022 |
| 0.9294791666666667 | 50.022 |
| 0.9294907407407407 | 50.022 |
| 0.9295023148148148 | 50.021 |
| 0.9295138888888889 | 50.022 |
| 0.929525462962963 | 50.023 |
| 0.9295370370370369 | 50.024 |
| 0.9295486111111111 | 50.026 |
| 0.9295601851851852 | 50.026 |
| 0.9295717592592593 | 50.024 |
| 0.9295833333333333 | 50.025 |
| 0.9295949074074074 | 50.023 |
| 0.9296064814814815 | 50.022 |
| 0.9296180555555557 | 50.021 |
| 0.9296296296296296 | 50.02 |
| 0.9296412037037037 | 50.018 |
| 0.9296527777777778 | 50.017 |
| 0.9296643518518519 | 50.015 |
| 0.9296759259259259 | 50.012 |
| 0.9296875 | 50.013 |
| 0.9296990740740741 | 50.016 |
| 0.9297106481481481 | 50.019 |
| 0.9297222222222222 | 50.019 |
| 0.9297337962962963 | 50.02 |
| 0.9297453703703704 | 50.02 |
| 0.9297569444444443 | 50.022 |
| 0.9297685185185185 | 50.022 |
| 0.9297800925925926 | 50.021 |
| 0.9297916666666667 | 50.019 |
| 0.9298032407407407 | 50.017 |
| 0.9298148148148148 | 50.017 |
| 0.9298263888888889 | 50.017 |
| 0.9298379629629631 | 50.018 |
| 0.929849537037037 | 50.021 |
| 0.9298611111111111 | 50.02 |
| 0.9298726851851852 | 50.019 |
| 0.9298842592592593 | 50.017 |
| 0.9298958333333333 | 50.016 |
| 0.9299074074074074 | 50.016 |
| 0.9299189814814816 | 50.014 |
| 0.9299305555555556 | 50.011 |
| 0.9299421296296296 | 50.008 |
| 0.9299537037037037 | 50.005 |
| 0.9299652777777778 | 50.001 |
| 0.9299768518518517 | 49.998 |
| 0.9299884259259259 | 49.999 |
| 0.93 | 49.998 |
| 0.9300115740740741 | 49.998 |
| 0.9300231481481481 | 50 |
| 0.9300347222222222 | 50.002 |
| 0.9300462962962963 | 50.006 |
| 0.9300578703703705 | 50.008 |
| 0.9300694444444444 | 50.008 |
| 0.9300810185185185 | 50.01 |
| 0.9300925925925926 | 50.01 |
| 0.9301041666666667 | 50.01 |
| 0.9301157407407407 | 50.011 |
| 0.9301273148148148 | 50.014 |
| 0.930138888888889 | 50.016 |
| 0.930150462962963 | 50.017 |
| 0.930162037037037 | 50.019 |
| 0.9301736111111111 | 50.021 |
| 0.9301851851851852 | 50.022 |
| 0.9301967592592592 | 50.025 |
| 0.9302083333333333 | 50.028 |
| 0.9302199074074075 | 50.032 |
| 0.9302314814814815 | 50.036 |
| 0.9302430555555555 | 50.037 |
| 0.9302546296296296 | 50.04 |
| 0.9302662037037037 | 50.04 |
| 0.9302777777777779 | 50.035 |
| 0.9302893518518518 | 50.029 |
| 0.930300925925926 | 50.026 |
| 0.9303125 | 50.021 |
| 0.9303240740740741 | 50.017 |
| 0.9303356481481481 | 50.013 |
| 0.9303472222222222 | 50.011 |
| 0.9303587962962964 | 50.01 |
| 0.9303703703703704 | 50.009 |
| 0.9303819444444444 | 50.009 |
| 0.9303935185185185 | 50.008 |
| 0.9304050925925926 | 50.007 |
| 0.9304166666666666 | 50.008 |
| 0.9304282407407407 | 50.008 |
| 0.9304398148148149 | 50.008 |
| 0.9304513888888889 | 50.008 |
| 0.9304629629629629 | 50.006 |
| 0.930474537037037 | 50.006 |
| 0.9304861111111111 | 50.005 |
| 0.9304976851851853 | 50.006 |
| 0.9305092592592592 | 50.004 |
| 0.9305208333333334 | 50.004 |
| 0.9305324074074074 | 50.002 |
| 0.9305439814814815 | 50.001 |
| 0.9305555555555555 | 50 |
| 0.9305671296296296 | 49.999 |
| 0.9305787037037038 | 49.998 |
| 0.9305902777777778 | 49.995 |
| 0.9306018518518518 | 49.991 |
| 0.9306134259259259 | 49.988 |
| 0.930625 | 49.981 |
| 0.930636574074074 | 49.975 |
| 0.9306481481481481 | 49.97 |
| 0.9306597222222223 | 49.968 |
| 0.9306712962962963 | 49.968 |
| 0.9306828703703703 | 49.966 |
| 0.9306944444444444 | 49.964 |
| 0.9307060185185185 | 49.963 |
| 0.9307175925925927 | 49.961 |
| 0.9307291666666666 | 49.96 |
| 0.9307407407407408 | 49.961 |
| 0.9307523148148148 | 49.963 |
| 0.930763888888889 | 49.965 |
| 0.9307754629629629 | 49.965 |
| 0.930787037037037 | 49.965 |
| 0.9307986111111112 | 49.968 |
| 0.9308101851851852 | 49.969 |
| 0.9308217592592593 | 49.97 |
| 0.9308333333333333 | 49.972 |
| 0.9308449074074074 | 49.97 |
| 0.9308564814814816 | 49.969 |
| 0.9308680555555555 | 49.966 |
| 0.9308796296296297 | 49.965 |
| 0.9308912037037037 | 49.968 |
| 0.9309027777777777 | 49.969 |
| 0.9309143518518518 | 49.974 |
| 0.9309259259259259 | 49.977 |
| 0.9309375000000001 | 49.979 |
| 0.930949074074074 | 49.982 |
| 0.9309606481481482 | 49.987 |
| 0.9309722222222222 | 49.99 |
| 0.9309837962962964 | 49.992 |
| 0.9309953703703703 | 49.994 |
| 0.9310069444444444 | 49.997 |
| 0.9310185185185186 | 49.995 |
| 0.9310300925925926 | 49.994 |
| 0.9310416666666667 | 49.994 |
| 0.9310532407407407 | 49.993 |
| 0.9310648148148148 | 49.993 |
| 0.931076388888889 | 49.993 |
| 0.9310879629629629 | 49.991 |
| 0.9310995370370371 | 49.988 |
| 0.9311111111111111 | 49.987 |
| 0.9311226851851852 | 49.983 |
| 0.9311342592592592 | 49.98 |
| 0.9311458333333333 | 49.976 |
| 0.9311574074074075 | 49.976 |
| 0.9311689814814814 | 49.975 |
| 0.9311805555555556 | 49.975 |
| 0.9311921296296296 | 49.977 |
| 0.9312037037037038 | 49.981 |
| 0.9312152777777777 | 49.987 |
| 0.9312268518518518 | 49.991 |
| 0.931238425925926 | 49.992 |
| 0.93125 | 49.993 |
| 0.9312615740740741 | 49.991 |
| 0.9312731481481481 | 49.99 |
| 0.9312847222222222 | 49.987 |
| 0.9312962962962964 | 49.985 |
| 0.9313078703703703 | 49.981 |
| 0.9313194444444445 | 49.977 |
| 0.9313310185185185 | 49.972 |
| 0.9313425925925927 | 49.968 |
| 0.9313541666666666 | 49.967 |
| 0.9313657407407407 | 49.969 |
| 0.9313773148148149 | 49.97 |
| 0.9313888888888888 | 49.971 |
| 0.931400462962963 | 49.974 |
| 0.931412037037037 | 49.974 |
| 0.9314236111111112 | 49.975 |
| 0.9314351851851851 | 49.974 |
| 0.9314467592592592 | 49.973 |
| 0.9314583333333334 | 49.972 |
| 0.9314699074074074 | 49.973 |
| 0.9314814814814815 | 49.974 |
| 0.9314930555555555 | 49.974 |
| 0.9315046296296297 | 49.974 |
| 0.9315162037037038 | 49.973 |
| 0.9315277777777777 | 49.974 |
| 0.9315393518518519 | 49.973 |
| 0.9315509259259259 | 49.973 |
| 0.9315625000000001 | 49.973 |
| 0.931574074074074 | 49.973 |
| 0.9315856481481481 | 49.974 |
| 0.9315972222222223 | 49.976 |
| 0.9316087962962962 | 49.978 |
| 0.9316203703703704 | 49.98 |
| 0.9316319444444444 | 49.981 |
| 0.9316435185185186 | 49.981 |
| 0.9316550925925925 | 49.984 |
| 0.9316666666666666 | 49.985 |
| 0.9316782407407408 | 49.99 |
| 0.9316898148148148 | 49.992 |
| 0.9317013888888889 | 49.993 |
| 0.9317129629629629 | 49.994 |
| 0.9317245370370371 | 49.994 |
| 0.9317361111111112 | 49.995 |
| 0.9317476851851851 | 49.994 |
| 0.9317592592592593 | 49.993 |
| 0.9317708333333333 | 49.991 |
| 0.9317824074074075 | 49.989 |
| 0.9317939814814814 | 49.988 |
| 0.9318055555555556 | 49.987 |
| 0.9318171296296297 | 49.986 |
| 0.9318287037037036 | 49.984 |
| 0.9318402777777778 | 49.982 |
| 0.9318518518518518 | 49.979 |
| 0.931863425925926 | 49.977 |
| 0.9318749999999999 | 49.976 |
| 0.931886574074074 | 49.975 |
| 0.9318981481481482 | 49.973 |
| 0.9319097222222222 | 49.97 |
| 0.9319212962962963 | 49.968 |
| 0.9319328703703703 | 49.965 |
| 0.9319444444444445 | 49.965 |
| 0.9319560185185186 | 49.963 |
| 0.9319675925925925 | 49.962 |
| 0.9319791666666667 | 49.958 |
| 0.9319907407407407 | 49.958 |
| 0.9320023148148149 | 49.96 |
| 0.9320138888888888 | 49.96 |
| 0.932025462962963 | 49.959 |
| 0.9320370370370371 | 49.958 |
| 0.932048611111111 | 49.957 |
| 0.9320601851851852 | 49.958 |
| 0.9320717592592592 | 49.957 |
| 0.9320833333333334 | 49.957 |
| 0.9320949074074073 | 49.957 |
| 0.9321064814814815 | 49.96 |
| 0.9321180555555556 | 49.962 |
| 0.9321296296296296 | 49.966 |
| 0.9321412037037037 | 49.967 |
| 0.9321527777777777 | 49.967 |
| 0.9321643518518519 | 49.965 |
| 0.932175925925926 | 49.965 |
| 0.9321875 | 49.962 |
| 0.9321990740740741 | 49.961 |
| 0.9322106481481481 | 49.959 |
| 0.9322222222222223 | 49.956 |
| 0.9322337962962962 | 49.955 |
| 0.9322453703703704 | 49.954 |
| 0.9322569444444445 | 49.956 |
| 0.9322685185185186 | 49.957 |
| 0.9322800925925926 | 49.959 |
| 0.9322916666666666 | 49.958 |
| 0.9323032407407408 | 49.958 |
| 0.9323148148148147 | 49.959 |
| 0.9323263888888889 | 49.959 |
| 0.932337962962963 | 49.957 |
| 0.932349537037037 | 49.954 |
| 0.9323611111111111 | 49.952 |
| 0.9323726851851851 | 49.95 |
| 0.9323842592592593 | 49.948 |
| 0.9323958333333334 | 49.947 |
| 0.9324074074074074 | 49.947 |
| 0.9324189814814815 | 49.944 |
| 0.9324305555555555 | 49.944 |
| 0.9324421296296297 | 49.943 |
| 0.9324537037037036 | 49.944 |
| 0.9324652777777778 | 49.945 |
| 0.9324768518518519 | 49.944 |
| 0.932488425925926 | 49.939 |
| 0.9325 | 49.936 |
| 0.932511574074074 | 49.937 |
| 0.9325231481481482 | 49.939 |
| 0.9325347222222223 | 49.942 |
| 0.9325462962962963 | 49.946 |
| 0.9325578703703704 | 49.946 |
| 0.9325694444444445 | 49.948 |
| 0.9325810185185185 | 49.949 |
| 0.9325925925925925 | 49.95 |
| 0.9326041666666667 | 49.952 |
| 0.9326157407407408 | 49.953 |
| 0.9326273148148148 | 49.953 |
| 0.9326388888888889 | 49.95 |
| 0.932650462962963 | 49.949 |
| 0.9326620370370371 | 49.952 |
| 0.932673611111111 | 49.951 |
| 0.9326851851851852 | 49.954 |
| 0.9326967592592593 | 49.957 |
| 0.9327083333333334 | 49.96 |
| 0.9327199074074074 | 49.961 |
| 0.9327314814814814 | 49.962 |
| 0.9327430555555556 | 49.963 |
| 0.9327546296296297 | 49.963 |
| 0.9327662037037037 | 49.961 |
| 0.9327777777777778 | 49.959 |
| 0.9327893518518519 | 49.955 |
| 0.9328009259259259 | 49.952 |
| 0.9328124999999999 | 49.95 |
| 0.9328240740740741 | 49.948 |
| 0.9328356481481482 | 49.945 |
| 0.9328472222222222 | 49.942 |
| 0.9328587962962963 | 49.942 |
| 0.9328703703703703 | 49.943 |
| 0.9328819444444445 | 49.945 |
| 0.9328935185185184 | 49.946 |
| 0.9329050925925926 | 49.95 |
| 0.9329166666666667 | 49.952 |
| 0.9329282407407408 | 49.957 |
| 0.9329398148148148 | 49.96 |
| 0.9329513888888888 | 49.962 |
| 0.932962962962963 | 49.965 |
| 0.9329745370370371 | 49.967 |
| 0.9329861111111111 | 49.97 |
| 0.9329976851851852 | 49.97 |
| 0.9330092592592593 | 49.968 |
| 0.9330208333333333 | 49.966 |
| 0.9330324074074073 | 49.961 |
| 0.9330439814814815 | 49.961 |
| 0.9330555555555556 | 49.957 |
| 0.9330671296296296 | 49.953 |
| 0.9330787037037037 | 49.949 |
| 0.9330902777777778 | 49.947 |
| 0.9331018518518519 | 49.943 |
| 0.9331134259259258 | 49.941 |
| 0.933125 | 49.939 |
| 0.9331365740740741 | 49.938 |
| 0.9331481481481482 | 49.936 |
| 0.9331597222222222 | 49.935 |
| 0.9331712962962962 | 49.936 |
| 0.9331828703703704 | 49.937 |
| 0.9331944444444445 | 49.94 |
| 0.9332060185185185 | 49.942 |
| 0.9332175925925926 | 49.944 |
| 0.9332291666666667 | 49.942 |
| 0.9332407407407407 | 49.941 |
| 0.9332523148148147 | 49.94 |
| 0.9332638888888889 | 49.939 |
| 0.933275462962963 | 49.937 |
| 0.933287037037037 | 49.937 |
| 0.9332986111111111 | 49.939 |
| 0.9333101851851852 | 49.939 |
| 0.9333217592592593 | 49.939 |
| 0.9333333333333332 | 49.937 |
| 0.9333449074074074 | 49.936 |
| 0.9333564814814815 | 49.933 |
| 0.9333680555555556 | 49.931 |
| 0.9333796296296296 | 49.929 |
| 0.9333912037037037 | 49.93 |
| 0.9334027777777778 | 49.93 |
| 0.933414351851852 | 49.93 |
| 0.9334259259259259 | 49.929 |
| 0.9334375 | 49.928 |
| 0.9334490740740741 | 49.927 |
| 0.9334606481481482 | 49.925 |
| 0.9334722222222221 | 49.923 |
| 0.9334837962962963 | 49.921 |
| 0.9334953703703704 | 49.92 |
| 0.9335069444444444 | 49.92 |
| 0.9335185185185185 | 49.92 |
| 0.9335300925925926 | 49.919 |
| 0.9335416666666667 | 49.918 |
| 0.9335532407407406 | 49.917 |
| 0.9335648148148148 | 49.918 |
| 0.9335763888888889 | 49.918 |
| 0.933587962962963 | 49.917 |
| 0.933599537037037 | 49.92 |
| 0.9336111111111111 | 49.92 |
| 0.9336226851851852 | 49.924 |
| 0.9336342592592594 | 49.926 |
| 0.9336458333333333 | 49.928 |
| 0.9336574074074074 | 49.928 |
| 0.9336689814814815 | 49.928 |
| 0.9336805555555556 | 49.928 |
| 0.9336921296296296 | 49.927 |
| 0.9337037037037037 | 49.927 |
| 0.9337152777777779 | 49.926 |
| 0.9337268518518518 | 49.926 |
| 0.9337384259259259 | 49.928 |
| 0.93375 | 49.932 |
| 0.9337615740740741 | 49.933 |
| 0.933773148148148 | 49.936 |
| 0.9337847222222222 | 49.937 |
| 0.9337962962962963 | 49.938 |
| 0.9338078703703704 | 49.939 |
| 0.9338194444444444 | 49.938 |
| 0.9338310185185185 | 49.937 |
| 0.9338425925925926 | 49.935 |
| 0.9338541666666668 | 49.932 |
| 0.9338657407407407 | 49.93 |
| 0.9338773148148148 | 49.93 |
| 0.9338888888888889 | 49.933 |
| 0.933900462962963 | 49.936 |
| 0.933912037037037 | 49.942 |
| 0.9339236111111111 | 49.945 |
| 0.9339351851851853 | 49.949 |
| 0.9339467592592593 | 49.954 |
| 0.9339583333333333 | 49.958 |
| 0.9339699074074074 | 49.961 |
| 0.9339814814814815 | 49.962 |
| 0.9339930555555555 | 49.962 |
| 0.9340046296296296 | 49.959 |
| 0.9340162037037038 | 49.956 |
| 0.9340277777777778 | 49.956 |
| 0.9340393518518518 | 49.953 |
| 0.9340509259259259 | 49.951 |
| 0.9340625 | 49.951 |
| 0.9340740740740742 | 49.949 |
| 0.9340856481481481 | 49.949 |
| 0.9340972222222222 | 49.948 |
| 0.9341087962962963 | 49.947 |
| 0.9341203703703704 | 49.946 |
| 0.9341319444444444 | 49.949 |
| 0.9341435185185185 | 49.955 |
| 0.9341550925925927 | 49.959 |
| 0.9341666666666667 | 49.964 |
| 0.9341782407407407 | 49.968 |
| 0.9341898148148148 | 49.971 |
| 0.9342013888888889 | 49.97 |
| 0.9342129629629629 | 49.969 |
| 0.934224537037037 | 49.967 |
| 0.9342361111111112 | 49.966 |
| 0.9342476851851852 | 49.964 |
| 0.9342592592592592 | 49.962 |
| 0.9342708333333333 | 49.963 |
| 0.9342824074074074 | 49.962 |
| 0.9342939814814816 | 49.962 |
| 0.9343055555555555 | 49.963 |
| 0.9343171296296297 | 49.965 |
| 0.9343287037037037 | 49.964 |
| 0.9343402777777778 | 49.962 |
| 0.9343518518518518 | 49.959 |
| 0.9343634259259259 | 49.958 |
| 0.9343750000000001 | 49.961 |
| 0.9343865740740741 | 49.961 |
| 0.9343981481481481 | 49.965 |
| 0.9344097222222222 | 49.969 |
| 0.9344212962962963 | 49.972 |
| 0.9344328703703703 | 49.975 |
| 0.9344444444444444 | 49.977 |
| 0.9344560185185186 | 49.977 |
| 0.9344675925925926 | 49.974 |
| 0.9344791666666666 | 49.974 |
| 0.9344907407407407 | 49.971 |
| 0.9345023148148148 | 49.967 |
| 0.934513888888889 | 49.965 |
| 0.9345254629629629 | 49.961 |
| 0.934537037037037 | 49.957 |
| 0.9345486111111111 | 49.954 |
| 0.9345601851851852 | 49.953 |
| 0.9345717592592592 | 49.954 |
| 0.9345833333333333 | 49.954 |
| 0.9345949074074075 | 49.956 |
| 0.9346064814814815 | 49.957 |
| 0.9346180555555555 | 49.956 |
| 0.9346296296296296 | 49.955 |
| 0.9346412037037037 | 49.955 |
| 0.9346527777777777 | 49.955 |
| 0.9346643518518518 | 49.955 |
| 0.934675925925926 | 49.954 |
| 0.9346875 | 49.953 |
| 0.934699074074074 | 49.952 |
| 0.9347106481481481 | 49.952 |
| 0.9347222222222222 | 49.953 |
| 0.9347337962962964 | 49.956 |
| 0.9347453703703703 | 49.957 |
| 0.9347569444444445 | 49.958 |
| 0.9347685185185185 | 49.96 |
| 0.9347800925925926 | 49.962 |
| 0.9347916666666666 | 49.96 |
| 0.9348032407407407 | 49.956 |
| 0.9348148148148149 | 49.955 |
| 0.9348263888888889 | 49.953 |
| 0.934837962962963 | 49.952 |
| 0.934849537037037 | 49.947 |
| 0.9348611111111111 | 49.944 |
| 0.9348726851851853 | 49.94 |
| 0.9348842592592592 | 49.936 |
| 0.9348958333333334 | 49.933 |
| 0.9349074074074074 | 49.934 |
| 0.9349189814814814 | 49.934 |
| 0.9349305555555555 | 49.936 |
| 0.9349421296296296 | 49.938 |
| 0.9349537037037038 | 49.94 |
| 0.9349652777777777 | 49.94 |
| 0.9349768518518519 | 49.94 |
| 0.9349884259259259 | 49.94 |
| 0.935 | 49.94 |
| 0.935011574074074 | 49.94 |
| 0.9350231481481481 | 49.937 |
| 0.9350347222222223 | 49.936 |
| 0.9350462962962963 | 49.935 |
| 0.9350578703703704 | 49.937 |
| 0.9350694444444444 | 49.939 |
| 0.9350810185185185 | 49.94 |
| 0.9350925925925927 | 49.942 |
| 0.9351041666666666 | 49.943 |
| 0.9351157407407408 | 49.942 |
| 0.9351273148148148 | 49.941 |
| 0.935138888888889 | 49.939 |
| 0.9351504629629629 | 49.937 |
| 0.935162037037037 | 49.935 |
| 0.9351736111111112 | 49.932 |
| 0.9351851851851851 | 49.929 |
| 0.9351967592592593 | 49.928 |
| 0.9352083333333333 | 49.93 |
| 0.9352199074074075 | 49.93 |
| 0.9352314814814814 | 49.929 |
| 0.9352430555555555 | 49.929 |
| 0.9352546296296297 | 49.931 |
| 0.9352662037037037 | 49.932 |
| 0.9352777777777778 | 49.933 |
| 0.9352893518518518 | 49.93 |
| 0.935300925925926 | 49.928 |
| 0.9353125000000001 | 49.926 |
| 0.935324074074074 | 49.923 |
| 0.9353356481481482 | 49.919 |
| 0.9353472222222222 | 49.919 |
| 0.9353587962962964 | 49.921 |
| 0.9353703703703703 | 49.922 |
| 0.9353819444444444 | 49.924 |
| 0.9353935185185186 | 49.924 |
| 0.9354050925925925 | 49.927 |
| 0.9354166666666667 | 49.931 |
| 0.9354282407407407 | 49.931 |
| 0.9354398148148149 | 49.93 |
| 0.9354513888888888 | 49.927 |
| 0.9354629629629629 | 49.924 |
| 0.9354745370370371 | 49.925 |
| 0.9354861111111111 | 49.924 |
| 0.9354976851851852 | 49.926 |
| 0.9355092592592592 | 49.926 |
| 0.9355208333333334 | 49.926 |
| 0.9355324074074075 | 49.927 |
| 0.9355439814814814 | 49.929 |
| 0.9355555555555556 | 49.931 |
| 0.9355671296296296 | 49.934 |
| 0.9355787037037038 | 49.936 |
| 0.9355902777777777 | 49.94 |
| 0.9356018518518519 | 49.94 |
| 0.935613425925926 | 49.941 |
| 0.9356249999999999 | 49.943 |
| 0.9356365740740741 | 49.945 |
| 0.9356481481481481 | 49.946 |
| 0.9356597222222223 | 49.948 |
| 0.9356712962962962 | 49.948 |
| 0.9356828703703703 | 49.949 |
| 0.9356944444444445 | 49.95 |
| 0.9357060185185185 | 49.95 |
| 0.9357175925925926 | 49.95 |
| 0.9357291666666666 | 49.948 |
| 0.9357407407407408 | 49.947 |
| 0.9357523148148149 | 49.944 |
| 0.9357638888888888 | 49.944 |
| 0.935775462962963 | 49.945 |
| 0.935787037037037 | 49.943 |
| 0.9357986111111112 | 49.941 |
| 0.9358101851851851 | 49.94 |
| 0.9358217592592593 | 49.939 |
| 0.9358333333333334 | 49.937 |
| 0.9358449074074073 | 49.935 |
| 0.9358564814814815 | 49.932 |
| 0.9358680555555555 | 49.931 |
| 0.9358796296296297 | 49.931 |
| 0.9358912037037036 | 49.929 |
| 0.9359027777777778 | 49.929 |
| 0.9359143518518519 | 49.929 |
| 0.9359259259259259 | 49.928 |
| 0.9359375 | 49.927 |
| 0.935949074074074 | 49.928 |
| 0.9359606481481482 | 49.927 |
| 0.9359722222222223 | 49.929 |
| 0.9359837962962962 | 49.929 |
| 0.9359953703703704 | 49.93 |
| 0.9360069444444444 | 49.929 |
| 0.9360185185185186 | 49.927 |
| 0.9360300925925925 | 49.925 |
| 0.9360416666666667 | 49.925 |
| 0.9360532407407408 | 49.924 |
| 0.9360648148148148 | 49.922 |
| 0.9360763888888889 | 49.919 |
| 0.9360879629629629 | 49.918 |
| 0.9360995370370371 | 49.914 |
| 0.936111111111111 | 49.911 |
| 0.9361226851851852 | 49.908 |
| 0.9361342592592593 | 49.906 |
| 0.9361458333333333 | 49.905 |
| 0.9361574074074074 | 49.905 |
| 0.9361689814814814 | 49.907 |
| 0.9361805555555556 | 49.907 |
| 0.9361921296296297 | 49.907 |
| 0.9362037037037036 | 49.904 |
| 0.9362152777777778 | 49.902 |
| 0.9362268518518518 | 49.903 |
| 0.936238425925926 | 49.903 |
| 0.9362499999999999 | 49.903 |
| 0.9362615740740741 | 49.905 |
| 0.9362731481481482 | 49.907 |
| 0.9362847222222223 | 49.908 |
| 0.9362962962962963 | 49.91 |
| 0.9363078703703703 | 49.914 |
| 0.9363194444444445 | 49.914 |
| 0.9363310185185184 | 49.916 |
| 0.9363425925925926 | 49.919 |
| 0.9363541666666667 | 49.92 |
| 0.9363657407407407 | 49.919 |
| 0.9363773148148148 | 49.917 |
| 0.9363888888888888 | 49.915 |
| 0.936400462962963 | 49.915 |
| 0.9364120370370371 | 49.919 |
| 0.936423611111111 | 49.923 |
| 0.9364351851851852 | 49.924 |
| 0.9364467592592592 | 49.925 |
| 0.9364583333333334 | 49.926 |
| 0.9364699074074073 | 49.927 |
| 0.9364814814814815 | 49.929 |
| 0.9364930555555556 | 49.93 |
| 0.9365046296296297 | 49.928 |
| 0.9365162037037037 | 49.928 |
| 0.9365277777777777 | 49.927 |
| 0.9365393518518519 | 49.927 |
| 0.936550925925926 | 49.927 |
| 0.9365625 | 49.929 |
| 0.9365740740740741 | 49.932 |
| 0.9365856481481482 | 49.934 |
| 0.9365972222222222 | 49.935 |
| 0.9366087962962962 | 49.937 |
| 0.9366203703703704 | 49.94 |
| 0.9366319444444445 | 49.943 |
| 0.9366435185185185 | 49.942 |
| 0.9366550925925926 | 49.94 |
| 0.9366666666666666 | 49.938 |
| 0.9366782407407408 | 49.937 |
| 0.9366898148148147 | 49.936 |
| 0.9367013888888889 | 49.938 |
| 0.936712962962963 | 49.941 |
| 0.9367245370370371 | 49.945 |
| 0.9367361111111111 | 49.946 |
| 0.9367476851851851 | 49.943 |
| 0.9367592592592593 | 49.943 |
| 0.9367708333333334 | 49.94 |
| 0.9367824074074074 | 49.939 |
| 0.9367939814814815 | 49.938 |
| 0.9368055555555556 | 49.94 |
| 0.9368171296296296 | 49.937 |
| 0.9368287037037036 | 49.935 |
| 0.9368402777777778 | 49.932 |
| 0.9368518518518519 | 49.928 |
| 0.9368634259259259 | 49.927 |
| 0.936875 | 49.925 |
| 0.936886574074074 | 49.923 |
| 0.9368981481481482 | 49.922 |
| 0.9369097222222221 | 49.923 |
| 0.9369212962962963 | 49.924 |
| 0.9369328703703704 | 49.927 |
| 0.9369444444444445 | 49.929 |
| 0.9369560185185185 | 49.929 |
| 0.9369675925925925 | 49.929 |
| 0.9369791666666667 | 49.929 |
| 0.9369907407407408 | 49.929 |
| 0.9370023148148148 | 49.93 |
| 0.9370138888888889 | 49.93 |
| 0.937025462962963 | 49.932 |
| 0.937037037037037 | 49.931 |
| 0.937048611111111 | 49.931 |
| 0.9370601851851852 | 49.933 |
| 0.9370717592592593 | 49.933 |
| 0.9370833333333333 | 49.934 |
| 0.9370949074074074 | 49.935 |
| 0.9371064814814815 | 49.936 |
| 0.9371180555555556 | 49.936 |
| 0.9371296296296295 | 49.937 |
| 0.9371412037037037 | 49.937 |
| 0.9371527777777778 | 49.938 |
| 0.9371643518518519 | 49.938 |
| 0.9371759259259259 | 49.94 |
| 0.9371875 | 49.94 |
| 0.9371990740740741 | 49.94 |
| 0.9372106481481483 | 49.94 |
| 0.9372222222222222 | 49.938 |
| 0.9372337962962963 | 49.938 |
| 0.9372453703703704 | 49.936 |
| 0.9372569444444444 | 49.936 |
| 0.9372685185185184 | 49.937 |
| 0.9372800925925926 | 49.938 |
| 0.9372916666666667 | 49.941 |
| 0.9373032407407407 | 49.944 |
| 0.9373148148148148 | 49.946 |
| 0.9373263888888889 | 49.949 |
| 0.937337962962963 | 49.952 |
| 0.9373495370370369 | 49.953 |
| 0.9373611111111111 | 49.954 |
| 0.9373726851851852 | 49.955 |
| 0.9373842592592593 | 49.955 |
| 0.9373958333333333 | 49.955 |
| 0.9374074074074074 | 49.956 |
| 0.9374189814814815 | 49.957 |
| 0.9374305555555557 | 49.957 |
| 0.9374421296296296 | 49.956 |
| 0.9374537037037037 | 49.955 |
| 0.9374652777777778 | 49.952 |
| 0.9374768518518519 | 49.95 |
| 0.9374884259259259 | 49.947 |
| 0.9375 | 49.944 |
| 0.9375115740740741 | 49.941 |
| 0.9375231481481481 | 49.938 |
| 0.9375347222222222 | 49.933 |
| 0.9375462962962963 | 49.929 |
| 0.9375578703703704 | 49.929 |
| 0.9375694444444443 | 49.929 |
| 0.9375810185185185 | 49.931 |
| 0.9375925925925926 | 49.932 |
| 0.9376041666666667 | 49.933 |
| 0.9376157407407407 | 49.932 |
| 0.9376273148148148 | 49.933 |
| 0.9376388888888889 | 49.933 |
| 0.9376504629629631 | 49.935 |
| 0.937662037037037 | 49.938 |
| 0.9376736111111111 | 49.94 |
| 0.9376851851851852 | 49.943 |
| 0.9376967592592593 | 49.948 |
| 0.9377083333333333 | 49.95 |
| 0.9377199074074074 | 49.952 |
| 0.9377314814814816 | 49.954 |
| 0.9377430555555556 | 49.956 |
| 0.9377546296296296 | 49.958 |
| 0.9377662037037037 | 49.96 |
| 0.9377777777777778 | 49.962 |
| 0.9377893518518517 | 49.963 |
| 0.9378009259259259 | 49.964 |
| 0.9378125 | 49.962 |
| 0.9378240740740741 | 49.96 |
| 0.9378356481481481 | 49.96 |
| 0.9378472222222222 | 49.958 |
| 0.9378587962962963 | 49.956 |
| 0.9378703703703705 | 49.958 |
| 0.9378819444444444 | 49.96 |
| 0.9378935185185185 | 49.961 |
| 0.9379050925925926 | 49.964 |
| 0.9379166666666667 | 49.965 |
| 0.9379282407407407 | 49.966 |
| 0.9379398148148148 | 49.967 |
| 0.937951388888889 | 49.967 |
| 0.937962962962963 | 49.967 |
| 0.937974537037037 | 49.964 |
| 0.9379861111111111 | 49.961 |
| 0.9379976851851852 | 49.961 |
| 0.9380092592592592 | 49.961 |
| 0.9380208333333333 | 49.963 |
| 0.9380324074074075 | 49.967 |
| 0.9380439814814815 | 49.969 |
| 0.9380555555555555 | 49.972 |
| 0.9380671296296296 | 49.977 |
| 0.9380787037037037 | 49.981 |
| 0.9380902777777779 | 49.984 |
| 0.9381018518518518 | 49.983 |
| 0.938113425925926 | 49.983 |
| 0.938125 | 49.98 |
| 0.9381365740740741 | 49.978 |
| 0.9381481481481481 | 49.977 |
| 0.9381597222222222 | 49.977 |
| 0.9381712962962964 | 49.977 |
| 0.9381828703703704 | 49.976 |
| 0.9381944444444444 | 49.976 |
| 0.9382060185185185 | 49.975 |
| 0.9382175925925926 | 49.972 |
| 0.9382291666666666 | 49.969 |
| 0.9382407407407407 | 49.967 |
| 0.9382523148148149 | 49.964 |
| 0.9382638888888889 | 49.961 |
| 0.9382754629629629 | 49.959 |
| 0.938287037037037 | 49.957 |
| 0.9382986111111111 | 49.957 |
| 0.9383101851851853 | 49.957 |
| 0.9383217592592592 | 49.959 |
| 0.9383333333333334 | 49.956 |
| 0.9383449074074074 | 49.956 |
| 0.9383564814814815 | 49.954 |
| 0.9383680555555555 | 49.954 |
| 0.9383796296296296 | 49.955 |
| 0.9383912037037038 | 49.955 |
| 0.9384027777777778 | 49.957 |
| 0.9384143518518518 | 49.959 |
| 0.9384259259259259 | 49.959 |
| 0.9384375 | 49.958 |
| 0.938449074074074 | 49.959 |
| 0.9384606481481481 | 49.96 |
| 0.9384722222222223 | 49.958 |
| 0.9384837962962963 | 49.959 |
| 0.9384953703703703 | 49.959 |
| 0.9385069444444444 | 49.96 |
| 0.9385185185185185 | 49.962 |
| 0.9385300925925927 | 49.961 |
| 0.9385416666666666 | 49.963 |
| 0.9385532407407408 | 49.963 |
| 0.9385648148148148 | 49.962 |
| 0.938576388888889 | 49.962 |
| 0.9385879629629629 | 49.963 |
| 0.938599537037037 | 49.963 |
| 0.9386111111111112 | 49.961 |
| 0.9386226851851852 | 49.962 |
| 0.9386342592592593 | 49.96 |
| 0.9386458333333333 | 49.96 |
| 0.9386574074074074 | 49.959 |
| 0.9386689814814816 | 49.958 |
| 0.9386805555555555 | 49.958 |
| 0.9386921296296297 | 49.957 |
| 0.9387037037037037 | 49.955 |
| 0.9387152777777777 | 49.953 |
| 0.9387268518518518 | 49.952 |
| 0.9387384259259259 | 49.953 |
| 0.9387500000000001 | 49.954 |
| 0.938761574074074 | 49.953 |
| 0.9387731481481482 | 49.954 |
| 0.9387847222222222 | 49.956 |
| 0.9387962962962964 | 49.955 |
| 0.9388078703703703 | 49.955 |
| 0.9388194444444444 | 49.954 |
| 0.9388310185185186 | 49.953 |
| 0.9388425925925926 | 49.952 |
| 0.9388541666666667 | 49.95 |
| 0.9388657407407407 | 49.946 |
| 0.9388773148148148 | 49.942 |
| 0.938888888888889 | 49.94 |
| 0.9389004629629629 | 49.935 |
| 0.9389120370370371 | 49.932 |
| 0.9389236111111111 | 49.93 |
| 0.9389351851851853 | 49.93 |
| 0.9389467592592592 | 49.931 |
| 0.9389583333333333 | 49.932 |
| 0.9389699074074075 | 49.933 |
| 0.9389814814814814 | 49.934 |
| 0.9389930555555556 | 49.935 |
| 0.9390046296296296 | 49.934 |
| 0.9390162037037038 | 49.935 |
| 0.9390277777777777 | 49.936 |
| 0.9390393518518518 | 49.936 |
| 0.939050925925926 | 49.936 |
| 0.9390625 | 49.939 |
| 0.9390740740740741 | 49.942 |
| 0.9390856481481481 | 49.945 |
| 0.9390972222222222 | 49.948 |
| 0.9391087962962964 | 49.947 |
| 0.9391203703703703 | 49.948 |
| 0.9391319444444445 | 49.949 |
| 0.9391435185185185 | 49.95 |
| 0.9391550925925927 | 49.951 |
| 0.9391666666666666 | 49.951 |
| 0.9391782407407407 | 49.952 |
| 0.9391898148148149 | 49.954 |
| 0.9392013888888888 | 49.957 |
| 0.939212962962963 | 49.962 |
| 0.939224537037037 | 49.966 |
| 0.9392361111111112 | 49.971 |
| 0.9392476851851851 | 49.972 |
| 0.9392592592592592 | 49.975 |
| 0.9392708333333334 | 49.975 |
| 0.9392824074074074 | 49.976 |
| 0.9392939814814815 | 49.974 |
| 0.9393055555555555 | 49.97 |
| 0.9393171296296297 | 49.967 |
| 0.9393287037037038 | 49.963 |
| 0.9393402777777777 | 49.959 |
| 0.9393518518518519 | 49.957 |
| 0.9393634259259259 | 49.957 |
| 0.9393750000000001 | 49.959 |
| 0.939386574074074 | 49.962 |
| 0.9393981481481481 | 49.962 |
| 0.9394097222222223 | 49.963 |
| 0.9394212962962962 | 49.96 |
| 0.9394328703703704 | 49.959 |
| 0.9394444444444444 | 49.956 |
| 0.9394560185185186 | 49.953 |
| 0.9394675925925925 | 49.952 |
| 0.9394791666666666 | 49.95 |
| 0.9394907407407408 | 49.949 |
| 0.9395023148148148 | 49.947 |
| 0.9395138888888889 | 49.946 |
| 0.9395254629629629 | 49.947 |
| 0.9395370370370371 | 49.947 |
| 0.9395486111111112 | 49.948 |
| 0.9395601851851851 | 49.948 |
| 0.9395717592592593 | 49.948 |
| 0.9395833333333333 | 49.948 |
| 0.9395949074074075 | 49.947 |
| 0.9396064814814814 | 49.947 |
| 0.9396180555555556 | 49.947 |
| 0.9396296296296297 | 49.945 |
| 0.9396412037037036 | 49.946 |
| 0.9396527777777778 | 49.948 |
| 0.9396643518518518 | 49.951 |
| 0.939675925925926 | 49.955 |
| 0.9396874999999999 | 49.956 |
| 0.939699074074074 | 49.958 |
| 0.9397106481481482 | 49.96 |
| 0.9397222222222222 | 49.962 |
| 0.9397337962962963 | 49.964 |
| 0.9397453703703703 | 49.965 |
| 0.9397569444444445 | 49.966 |
| 0.9397685185185186 | 49.965 |
| 0.9397800925925925 | 49.965 |
| 0.9397916666666667 | 49.965 |
| 0.9398032407407407 | 49.965 |
| 0.9398148148148149 | 49.967 |
| 0.9398263888888888 | 49.966 |
| 0.939837962962963 | 49.966 |
| 0.9398495370370371 | 49.965 |
| 0.939861111111111 | 49.965 |
| 0.9398726851851852 | 49.966 |
| 0.9398842592592592 | 49.967 |
| 0.9398958333333334 | 49.969 |
| 0.9399074074074073 | 49.969 |
| 0.9399189814814815 | 49.97 |
| 0.9399305555555556 | 49.97 |
| 0.9399421296296296 | 49.97 |
| 0.9399537037037037 | 49.969 |
| 0.9399652777777777 | 49.967 |
| 0.9399768518518519 | 49.966 |
| 0.939988425925926 | 49.966 |
| 0.94 | 49.966 |
| 0.9400115740740741 | 49.966 |
| 0.9400231481481481 | 49.966 |
| 0.9400347222222223 | 49.966 |
| 0.9400462962962962 | 49.966 |
| 0.9400578703703704 | 49.966 |
| 0.9400694444444445 | 49.967 |
| 0.9400810185185186 | 49.966 |
| 0.9400925925925926 | 49.966 |
| 0.9401041666666666 | 49.965 |
| 0.9401157407407408 | 49.965 |
| 0.9401273148148147 | 49.966 |
| 0.9401388888888889 | 49.965 |
| 0.940150462962963 | 49.965 |
| 0.940162037037037 | 49.965 |
| 0.9401736111111111 | 49.963 |
| 0.9401851851851851 | 49.961 |
| 0.9401967592592593 | 49.959 |
| 0.9402083333333334 | 49.957 |
| 0.9402199074074074 | 49.954 |
| 0.9402314814814815 | 49.952 |
| 0.9402430555555555 | 49.951 |
| 0.9402546296296297 | 49.95 |
| 0.9402662037037036 | 49.951 |
| 0.9402777777777778 | 49.95 |
| 0.9402893518518519 | 49.95 |
| 0.940300925925926 | 49.948 |
| 0.9403125 | 49.947 |
| 0.940324074074074 | 49.945 |
| 0.9403356481481482 | 49.945 |
| 0.9403472222222223 | 49.945 |
| 0.9403587962962963 | 49.943 |
| 0.9403703703703704 | 49.943 |
| 0.9403819444444445 | 49.943 |
| 0.9403935185185185 | 49.945 |
| 0.9404050925925925 | 49.946 |
| 0.9404166666666667 | 49.947 |
| 0.9404282407407408 | 49.948 |
| 0.9404398148148148 | 49.948 |
| 0.9404513888888889 | 49.95 |
| 0.940462962962963 | 49.95 |
| 0.9404745370370371 | 49.95 |
| 0.940486111111111 | 49.95 |
| 0.9404976851851852 | 49.951 |
| 0.9405092592592593 | 49.954 |
| 0.9405208333333334 | 49.957 |
| 0.9405324074074074 | 49.958 |
| 0.9405439814814814 | 49.959 |
| 0.9405555555555556 | 49.959 |
| 0.9405671296296297 | 49.959 |
| 0.9405787037037037 | 49.96 |
| 0.9405902777777778 | 49.959 |
| 0.9406018518518519 | 49.959 |
| 0.9406134259259259 | 49.957 |
| 0.9406249999999999 | 49.955 |
| 0.9406365740740741 | 49.953 |
| 0.9406481481481482 | 49.95 |
| 0.9406597222222222 | 49.95 |
| 0.9406712962962963 | 49.951 |
| 0.9406828703703703 | 49.954 |
| 0.9406944444444445 | 49.958 |
| 0.9407060185185184 | 49.961 |
| 0.9407175925925926 | 49.962 |
| 0.9407291666666667 | 49.965 |
| 0.9407407407407408 | 49.966 |
| 0.9407523148148148 | 49.965 |
| 0.9407638888888888 | 49.963 |
| 0.940775462962963 | 49.961 |
| 0.9407870370370371 | 49.96 |
| 0.9407986111111111 | 49.959 |
| 0.9408101851851852 | 49.958 |
| 0.9408217592592593 | 49.956 |
| 0.9408333333333333 | 49.955 |
| 0.9408449074074073 | 49.954 |
| 0.9408564814814815 | 49.952 |
| 0.9408680555555556 | 49.951 |
| 0.9408796296296296 | 49.947 |
| 0.9408912037037037 | 49.945 |
| 0.9409027777777778 | 49.945 |
| 0.9409143518518519 | 49.945 |
| 0.9409259259259258 | 49.945 |
| 0.9409375 | 49.943 |
| 0.9409490740740741 | 49.942 |
| 0.9409606481481482 | 49.94 |
| 0.9409722222222222 | 49.939 |
| 0.9409837962962962 | 49.937 |
| 0.9409953703703704 | 49.935 |
| 0.9410069444444445 | 49.932 |
| 0.9410185185185185 | 49.931 |
| 0.9410300925925926 | 49.931 |
| 0.9410416666666667 | 49.932 |
| 0.9410532407407407 | 49.933 |
| 0.9410648148148147 | 49.933 |
| 0.9410763888888889 | 49.933 |
| 0.941087962962963 | 49.932 |
| 0.941099537037037 | 49.932 |
| 0.9411111111111111 | 49.931 |
| 0.9411226851851852 | 49.93 |
| 0.9411342592592593 | 49.93 |
| 0.9411458333333332 | 49.928 |
| 0.9411574074074074 | 49.928 |
| 0.9411689814814815 | 49.928 |
| 0.9411805555555556 | 49.927 |
| 0.9411921296296296 | 49.926 |
| 0.9412037037037037 | 49.925 |
| 0.9412152777777778 | 49.923 |
| 0.941226851851852 | 49.92 |
| 0.9412384259259259 | 49.92 |
| 0.94125 | 49.919 |
| 0.9412615740740741 | 49.921 |
| 0.9412731481481481 | 49.922 |
| 0.9412847222222221 | 49.922 |
| 0.9412962962962963 | 49.923 |
| 0.9413078703703704 | 49.925 |
| 0.9413194444444444 | 49.927 |
| 0.9413310185185185 | 49.927 |
| 0.9413425925925926 | 49.928 |
| 0.9413541666666667 | 49.926 |
| 0.9413657407407406 | 49.926 |
| 0.9413773148148148 | 49.924 |
| 0.9413888888888889 | 49.923 |
| 0.941400462962963 | 49.923 |
| 0.941412037037037 | 49.924 |
| 0.9414236111111111 | 49.924 |
| 0.9414351851851852 | 49.925 |
| 0.9414467592592594 | 49.925 |
| 0.9414583333333333 | 49.924 |
| 0.9414699074074074 | 49.925 |
| 0.9414814814814815 | 49.925 |
| 0.9414930555555556 | 49.926 |
| 0.9415046296296296 | 49.928 |
| 0.9415162037037037 | 49.928 |
| 0.9415277777777779 | 49.929 |
| 0.9415393518518519 | 49.929 |
| 0.9415509259259259 | 49.929 |
| 0.9415625 | 49.928 |
| 0.9415740740740741 | 49.926 |
| 0.941585648148148 | 49.926 |
| 0.9415972222222222 | 49.925 |
| 0.9416087962962963 | 49.923 |
| 0.9416203703703704 | 49.922 |
| 0.9416319444444444 | 49.921 |
| 0.9416435185185185 | 49.922 |
| 0.9416550925925926 | 49.924 |
| 0.9416666666666668 | 49.928 |
| 0.9416782407407407 | 49.929 |
| 0.9416898148148148 | 49.929 |
| 0.9417013888888889 | 49.93 |
| 0.941712962962963 | 49.93 |
| 0.941724537037037 | 49.932 |
| 0.9417361111111111 | 49.936 |
| 0.9417476851851853 | 49.942 |
| 0.9417592592592593 | 49.948 |
| 0.9417708333333333 | 49.951 |
| 0.9417824074074074 | 49.952 |
| 0.9417939814814815 | 49.953 |
| 0.9418055555555555 | 49.954 |
| 0.9418171296296296 | 49.956 |
| 0.9418287037037038 | 49.956 |
| 0.9418402777777778 | 49.957 |
| 0.9418518518518518 | 49.955 |
| 0.9418634259259259 | 49.952 |
| 0.941875 | 49.95 |
| 0.9418865740740742 | 49.947 |
| 0.9418981481481481 | 49.948 |
| 0.9419097222222222 | 49.949 |
| 0.9419212962962963 | 49.951 |
| 0.9419328703703704 | 49.952 |
| 0.9419444444444444 | 49.953 |
| 0.9419560185185185 | 49.955 |
| 0.9419675925925927 | 49.955 |
| 0.9419791666666667 | 49.954 |
| 0.9419907407407407 | 49.952 |
| 0.9420023148148148 | 49.95 |
| 0.9420138888888889 | 49.947 |
| 0.9420254629629629 | 49.945 |
| 0.942037037037037 | 49.944 |
| 0.9420486111111112 | 49.943 |
| 0.9420601851851852 | 49.943 |
| 0.9420717592592592 | 49.944 |
| 0.9420833333333333 | 49.945 |
| 0.9420949074074074 | 49.946 |
| 0.9421064814814816 | 49.945 |
| 0.9421180555555555 | 49.947 |
| 0.9421296296296297 | 49.947 |
| 0.9421412037037037 | 49.946 |
| 0.9421527777777778 | 49.943 |
| 0.9421643518518518 | 49.941 |
| 0.9421759259259259 | 49.939 |
| 0.9421875000000001 | 49.94 |
| 0.9421990740740741 | 49.942 |
| 0.9422106481481481 | 49.942 |
| 0.9422222222222222 | 49.944 |
| 0.9422337962962963 | 49.944 |
| 0.9422453703703703 | 49.946 |
| 0.9422569444444444 | 49.947 |
| 0.9422685185185186 | 49.948 |
| 0.9422800925925926 | 49.948 |
| 0.9422916666666666 | 49.948 |
| 0.9423032407407407 | 49.948 |
| 0.9423148148148148 | 49.949 |
| 0.942326388888889 | 49.949 |
| 0.9423379629629629 | 49.95 |
| 0.942349537037037 | 49.951 |
| 0.9423611111111111 | 49.953 |
| 0.9423726851851852 | 49.954 |
| 0.9423842592592592 | 49.953 |
| 0.9423958333333333 | 49.953 |
| 0.9424074074074075 | 49.955 |
| 0.9424189814814815 | 49.957 |
| 0.9424305555555555 | 49.959 |
| 0.9424421296296296 | 49.958 |
| 0.9424537037037037 | 49.957 |
| 0.9424652777777777 | 49.957 |
| 0.9424768518518518 | 49.956 |
| 0.942488425925926 | 49.956 |
| 0.9425 | 49.956 |
| 0.942511574074074 | 49.955 |
| 0.9425231481481481 | 49.954 |
| 0.9425347222222222 | 49.955 |
| 0.9425462962962964 | 49.957 |
| 0.9425578703703703 | 49.958 |
| 0.9425694444444445 | 49.961 |
| 0.9425810185185185 | 49.964 |
| 0.9425925925925926 | 49.966 |
| 0.9426041666666666 | 49.967 |
| 0.9426157407407407 | 49.967 |
| 0.9426273148148149 | 49.967 |
| 0.9426388888888889 | 49.965 |
| 0.942650462962963 | 49.963 |
| 0.942662037037037 | 49.96 |
| 0.9426736111111111 | 49.957 |
| 0.9426851851851853 | 49.955 |
| 0.9426967592592592 | 49.949 |
| 0.9427083333333334 | 49.942 |
| 0.9427199074074074 | 49.936 |
| 0.9427314814814814 | 49.931 |
| 0.9427430555555555 | 49.928 |
| 0.9427546296296296 | 49.927 |
| 0.9427662037037038 | 49.926 |
| 0.9427777777777777 | 49.927 |
| 0.9427893518518519 | 49.925 |
| 0.9428009259259259 | 49.924 |
| 0.9428125 | 49.924 |
| 0.942824074074074 | 49.924 |
| 0.9428356481481481 | 49.926 |
| 0.9428472222222223 | 49.926 |
| 0.9428587962962963 | 49.926 |
| 0.9428703703703704 | 49.924 |
| 0.9428819444444444 | 49.922 |
| 0.9428935185185185 | 49.921 |
| 0.9429050925925927 | 49.921 |
| 0.9429166666666666 | 49.919 |
| 0.9429282407407408 | 49.917 |
| 0.9429398148148148 | 49.916 |
| 0.942951388888889 | 49.918 |
| 0.9429629629629629 | 49.919 |
| 0.942974537037037 | 49.919 |
| 0.9429861111111112 | 49.92 |
| 0.9429976851851851 | 49.921 |
| 0.9430092592592593 | 49.923 |
| 0.9430208333333333 | 49.925 |
| 0.9430324074074075 | 49.927 |
| 0.9430439814814814 | 49.928 |
| 0.9430555555555555 | 49.93 |
| 0.9430671296296297 | 49.932 |
| 0.9430787037037037 | 49.93 |
| 0.9430902777777778 | 49.929 |
| 0.9431018518518518 | 49.929 |
| 0.943113425925926 | 49.928 |
| 0.9431250000000001 | 49.929 |
| 0.943136574074074 | 49.927 |
| 0.9431481481481482 | 49.925 |
| 0.9431597222222222 | 49.925 |
| 0.9431712962962964 | 49.924 |
| 0.9431828703703703 | 49.924 |
| 0.9431944444444444 | 49.924 |
| 0.9432060185185186 | 49.925 |
| 0.9432175925925925 | 49.923 |
| 0.9432291666666667 | 49.923 |
| 0.9432407407407407 | 49.923 |
| 0.9432523148148149 | 49.923 |
| 0.9432638888888888 | 49.923 |
| 0.9432754629629629 | 49.923 |
| 0.9432870370370371 | 49.925 |
| 0.9432986111111111 | 49.926 |
| 0.9433101851851852 | 49.926 |
| 0.9433217592592592 | 49.926 |
| 0.9433333333333334 | 49.926 |
| 0.9433449074074075 | 49.928 |
| 0.9433564814814814 | 49.931 |
| 0.9433680555555556 | 49.93 |
| 0.9433796296296296 | 49.929 |
| 0.9433912037037038 | 49.928 |
| 0.9434027777777777 | 49.928 |
| 0.9434143518518519 | 49.928 |
| 0.943425925925926 | 49.928 |
| 0.9434374999999999 | 49.929 |
| 0.9434490740740741 | 49.931 |
| 0.9434606481481481 | 49.931 |
| 0.9434722222222223 | 49.932 |
| 0.9434837962962962 | 49.932 |
| 0.9434953703703703 | 49.932 |
| 0.9435069444444445 | 49.933 |
| 0.9435185185185185 | 49.935 |
| 0.9435300925925926 | 49.936 |
| 0.9435416666666666 | 49.937 |
| 0.9435532407407408 | 49.937 |
| 0.9435648148148149 | 49.938 |
| 0.9435763888888888 | 49.939 |
| 0.943587962962963 | 49.941 |
| 0.943599537037037 | 49.942 |
| 0.9436111111111112 | 49.943 |
| 0.9436226851851851 | 49.942 |
| 0.9436342592592593 | 49.942 |
| 0.9436458333333334 | 49.942 |
| 0.9436574074074073 | 49.945 |
| 0.9436689814814815 | 49.947 |
| 0.9436805555555555 | 49.947 |
| 0.9436921296296297 | 49.946 |
| 0.9437037037037036 | 49.944 |
| 0.9437152777777778 | 49.942 |
| 0.9437268518518519 | 49.94 |
| 0.9437384259259259 | 49.938 |
| 0.94375 | 49.937 |
| 0.943761574074074 | 49.935 |
| 0.9437731481481482 | 49.933 |
| 0.9437847222222223 | 49.932 |
| 0.9437962962962962 | 49.933 |
| 0.9438078703703704 | 49.935 |
| 0.9438194444444444 | 49.938 |
| 0.9438310185185186 | 49.941 |
| 0.9438425925925925 | 49.943 |
| 0.9438541666666667 | 49.946 |
| 0.9438657407407408 | 49.946 |
| 0.9438773148148147 | 49.946 |
| 0.9438888888888889 | 49.943 |
| 0.9439004629629629 | 49.939 |
| 0.9439120370370371 | 49.935 |
| 0.943923611111111 | 49.932 |
| 0.9439351851851852 | 49.93 |
| 0.9439467592592593 | 49.93 |
| 0.9439583333333333 | 49.93 |
| 0.9439699074074074 | 49.931 |
| 0.9439814814814814 | 49.933 |
| 0.9439930555555556 | 49.934 |
| 0.9440046296296297 | 49.935 |
| 0.9440162037037036 | 49.936 |
| 0.9440277777777778 | 49.938 |
| 0.9440393518518518 | 49.938 |
| 0.944050925925926 | 49.939 |
| 0.9440624999999999 | 49.938 |
| 0.9440740740740741 | 49.937 |
| 0.9440856481481482 | 49.936 |
| 0.9440972222222223 | 49.934 |
| 0.9441087962962963 | 49.932 |
| 0.9441203703703703 | 49.931 |
| 0.9441319444444445 | 49.931 |
| 0.9441435185185186 | 49.927 |
| 0.9441550925925926 | 49.925 |
| 0.9441666666666667 | 49.923 |
| 0.9441782407407407 | 49.921 |
| 0.9441898148148148 | 49.919 |
| 0.9442013888888888 | 49.917 |
| 0.944212962962963 | 49.914 |
| 0.9442245370370371 | 49.912 |
| 0.944236111111111 | 49.912 |
| 0.9442476851851852 | 49.912 |
| 0.9442592592592592 | 49.912 |
| 0.9442708333333334 | 49.912 |
| 0.9442824074074073 | 49.913 |
| 0.9442939814814815 | 49.912 |
| 0.9443055555555556 | 49.911 |
| 0.9443171296296297 | 49.909 |
| 0.9443287037037037 | 49.909 |
| 0.9443402777777777 | 49.907 |
| 0.9443518518518519 | 49.909 |
| 0.944363425925926 | 49.91 |
| 0.944375 | 49.909 |
| 0.9443865740740741 | 49.908 |
| 0.9443981481481482 | 49.908 |
| 0.9444097222222222 | 49.907 |
| 0.9444212962962962 | 49.909 |
| 0.9444328703703704 | 49.908 |
| 0.9444444444444445 | 49.908 |
| 0.9444560185185185 | 49.91 |
| 0.9444675925925926 | 49.909 |
| 0.9444791666666666 | 49.909 |
| 0.9444907407407408 | 49.91 |
| 0.9445023148148147 | 49.911 |
| 0.9445138888888889 | 49.909 |
| 0.944525462962963 | 49.91 |
| 0.9445370370370371 | 49.911 |
| 0.9445486111111111 | 49.909 |
| 0.9445601851851851 | 49.91 |
| 0.9445717592592593 | 49.909 |
| 0.9445833333333334 | 49.908 |
| 0.9445949074074074 | 49.906 |
| 0.9446064814814815 | 49.906 |
| 0.9446180555555556 | 49.904 |
| 0.9446296296296296 | 49.903 |
| 0.9446412037037036 | 49.902 |
| 0.9446527777777778 | 49.901 |
| 0.9446643518518519 | 49.9 |
| 0.9446759259259259 | 49.899 |
| 0.9446875 | 49.9 |
| 0.944699074074074 | 49.898 |
| 0.9447106481481482 | 49.898 |
| 0.9447222222222221 | 49.897 |
| 0.9447337962962963 | 49.897 |
| 0.9447453703703704 | 49.899 |
| 0.9447569444444445 | 49.9 |
| 0.9447685185185185 | 49.903 |
| 0.9447800925925925 | 49.905 |
| 0.9447916666666667 | 49.905 |
| 0.9448032407407408 | 49.907 |
| 0.9448148148148148 | 49.906 |
| 0.9448263888888889 | 49.903 |
| 0.944837962962963 | 49.903 |
| 0.944849537037037 | 49.898 |
| 0.944861111111111 | 49.895 |
| 0.9448726851851852 | 49.894 |
| 0.9448842592592593 | 49.894 |
| 0.9448958333333333 | 49.893 |
| 0.9449074074074074 | 49.893 |
| 0.9449189814814815 | 49.893 |
| 0.9449305555555556 | 49.892 |
| 0.9449421296296295 | 49.892 |
| 0.9449537037037037 | 49.89 |
| 0.9449652777777778 | 49.89 |
| 0.9449768518518519 | 49.895 |
| 0.9449884259259259 | 49.897 |
| 0.945 | 49.897 |
| 0.9450115740740741 | 49.9 |
| 0.9450231481481483 | 49.901 |
| 0.9450347222222222 | 49.902 |
| 0.9450462962962963 | 49.902 |
| 0.9450578703703704 | 49.902 |
| 0.9450694444444444 | 49.9 |
| 0.9450810185185184 | 49.901 |
| 0.9450925925925926 | 49.901 |
| 0.9451041666666667 | 49.901 |
| 0.9451157407407407 | 49.901 |
| 0.9451273148148148 | 49.902 |
| 0.9451388888888889 | 49.903 |
| 0.945150462962963 | 49.904 |
| 0.9451620370370369 | 49.902 |
| 0.9451736111111111 | 49.901 |
| 0.9451851851851852 | 49.902 |
| 0.9451967592592593 | 49.904 |
| 0.9452083333333333 | 49.903 |
| 0.9452199074074074 | 49.901 |
| 0.9452314814814815 | 49.899 |
| 0.9452430555555557 | 49.898 |
| 0.9452546296296296 | 49.899 |
| 0.9452662037037037 | 49.901 |
| 0.9452777777777778 | 49.902 |
| 0.9452893518518519 | 49.904 |
| 0.9453009259259259 | 49.907 |
| 0.9453125 | 49.908 |
| 0.9453240740740741 | 49.908 |
| 0.9453356481481481 | 49.907 |
| 0.9453472222222222 | 49.904 |
| 0.9453587962962963 | 49.903 |
| 0.9453703703703704 | 49.901 |
| 0.9453819444444443 | 49.901 |
| 0.9453935185185185 | 49.902 |
| 0.9454050925925926 | 49.906 |
| 0.9454166666666667 | 49.91 |
| 0.9454282407407407 | 49.913 |
| 0.9454398148148148 | 49.916 |
| 0.9454513888888889 | 49.916 |
| 0.9454629629629631 | 49.915 |
| 0.945474537037037 | 49.915 |
| 0.9454861111111111 | 49.915 |
| 0.9454976851851852 | 49.913 |
| 0.9455092592592593 | 49.909 |
| 0.9455208333333333 | 49.91 |
| 0.9455324074074074 | 49.909 |
| 0.9455439814814816 | 49.908 |
| 0.9455555555555556 | 49.908 |
| 0.9455671296296296 | 49.909 |
| 0.9455787037037037 | 49.907 |
| 0.9455902777777778 | 49.907 |
| 0.9456018518518517 | 49.909 |
| 0.9456134259259259 | 49.911 |
| 0.945625 | 49.911 |
| 0.9456365740740741 | 49.911 |
| 0.9456481481481481 | 49.912 |
| 0.9456597222222222 | 49.91 |
| 0.9456712962962963 | 49.908 |
| 0.9456828703703705 | 49.907 |
| 0.9456944444444444 | 49.907 |
| 0.9457060185185185 | 49.907 |
| 0.9457175925925926 | 49.905 |
| 0.9457291666666667 | 49.906 |
| 0.9457407407407407 | 49.905 |
| 0.9457523148148148 | 49.909 |
| 0.945763888888889 | 49.911 |
| 0.945775462962963 | 49.911 |
| 0.945787037037037 | 49.912 |
| 0.9457986111111111 | 49.912 |
| 0.9458101851851852 | 49.913 |
| 0.9458217592592592 | 49.913 |
| 0.9458333333333333 | 49.912 |
| 0.9458449074074075 | 49.912 |
| 0.9458564814814815 | 49.913 |
| 0.9458680555555555 | 49.912 |
| 0.9458796296296296 | 49.913 |
| 0.9458912037037037 | 49.913 |
| 0.9459027777777779 | 49.914 |
| 0.9459143518518518 | 49.914 |
| 0.945925925925926 | 49.914 |
| 0.9459375 | 49.915 |
| 0.9459490740740741 | 49.919 |
| 0.9459606481481481 | 49.921 |
| 0.9459722222222222 | 49.922 |
| 0.9459837962962964 | 49.925 |
| 0.9459953703703704 | 49.926 |
| 0.9460069444444444 | 49.926 |
| 0.9460185185185185 | 49.925 |
| 0.9460300925925926 | 49.924 |
| 0.9460416666666666 | 49.923 |
| 0.9460532407407407 | 49.921 |
| 0.9460648148148149 | 49.919 |
| 0.9460763888888889 | 49.92 |
| 0.9460879629629629 | 49.92 |
| 0.946099537037037 | 49.92 |
| 0.9461111111111111 | 49.921 |
| 0.9461226851851853 | 49.921 |
| 0.9461342592592592 | 49.919 |
| 0.9461458333333334 | 49.919 |
| 0.9461574074074074 | 49.919 |
| 0.9461689814814815 | 49.92 |
| 0.9461805555555555 | 49.922 |
| 0.9461921296296296 | 49.923 |
| 0.9462037037037038 | 49.924 |
| 0.9462152777777778 | 49.924 |
| 0.9462268518518518 | 49.925 |
| 0.9462384259259259 | 49.925 |
| 0.94625 | 49.925 |
| 0.946261574074074 | 49.926 |
| 0.9462731481481481 | 49.923 |
| 0.9462847222222223 | 49.924 |
| 0.9462962962962963 | 49.922 |
| 0.9463078703703703 | 49.92 |
| 0.9463194444444444 | 49.921 |
| 0.9463310185185185 | 49.921 |
| 0.9463425925925927 | 49.919 |
| 0.9463541666666666 | 49.919 |
| 0.9463657407407408 | 49.919 |
| 0.9463773148148148 | 49.919 |
| 0.946388888888889 | 49.92 |
| 0.9464004629629629 | 49.919 |
| 0.946412037037037 | 49.919 |
| 0.9464236111111112 | 49.919 |
| 0.9464351851851852 | 49.917 |
| 0.9464467592592593 | 49.917 |
| 0.9464583333333333 | 49.914 |
| 0.9464699074074074 | 49.913 |
| 0.9464814814814814 | 49.913 |
| 0.9464930555555555 | 49.913 |
| 0.9465046296296297 | 49.914 |
| 0.9465162037037037 | 49.914 |
| 0.9465277777777777 | 49.913 |
| 0.9465393518518518 | 49.912 |
| 0.9465509259259259 | 49.912 |
| 0.9465625000000001 | 49.911 |
| 0.946574074074074 | 49.91 |
| 0.9465856481481482 | 49.91 |
| 0.9465972222222222 | 49.91 |
| 0.9466087962962964 | 49.908 |
| 0.9466203703703703 | 49.905 |
| 0.9466319444444444 | 49.904 |
| 0.9466435185185186 | 49.903 |
| 0.9466550925925926 | 49.903 |
| 0.9466666666666667 | 49.905 |
| 0.9466782407407407 | 49.904 |
| 0.9466898148148148 | 49.906 |
| 0.946701388888889 | 49.905 |
| 0.9467129629629629 | 49.906 |
| 0.9467245370370371 | 49.907 |
| 0.9467361111111111 | 49.906 |
| 0.9467476851851853 | 49.905 |
| 0.9467592592592592 | 49.907 |
| 0.9467708333333333 | 49.909 |
| 0.9467824074074075 | 49.91 |
| 0.9467939814814814 | 49.912 |
| 0.9468055555555556 | 49.912 |
| 0.9468171296296296 | 49.911 |
| 0.9468287037037038 | 49.913 |
| 0.9468402777777777 | 49.912 |
| 0.9468518518518518 | 49.91 |
| 0.946863425925926 | 49.91 |
| 0.946875 | 49.908 |
| 0.9468865740740741 | 49.907 |
| 0.9468981481481481 | 49.905 |
| 0.9469097222222222 | 49.902 |
| 0.9469212962962964 | 49.899 |
| 0.9469328703703703 | 49.897 |
| 0.9469444444444445 | 49.895 |
| 0.9469560185185185 | 49.894 |
| 0.9469675925925927 | 49.894 |
| 0.9469791666666666 | 49.897 |
| 0.9469907407407407 | 49.901 |
| 0.9470023148148149 | 49.902 |
| 0.9470138888888888 | 49.903 |
| 0.947025462962963 | 49.904 |
| 0.947037037037037 | 49.906 |
| 0.9470486111111112 | 49.906 |
| 0.9470601851851851 | 49.906 |
| 0.9470717592592592 | 49.907 |
| 0.9470833333333334 | 49.907 |
| 0.9470949074074074 | 49.908 |
| 0.9471064814814815 | 49.906 |
| 0.9471180555555555 | 49.907 |
| 0.9471296296296297 | 49.907 |
| 0.9471412037037038 | 49.908 |
| 0.9471527777777777 | 49.907 |
| 0.9471643518518519 | 49.906 |
| 0.9471759259259259 | 49.905 |
| 0.9471875000000001 | 49.903 |
| 0.947199074074074 | 49.905 |
| 0.9472106481481481 | 49.906 |
| 0.9472222222222223 | 49.907 |
| 0.9472337962962962 | 49.908 |
| 0.9472453703703704 | 49.909 |
| 0.9472569444444444 | 49.911 |
| 0.9472685185185186 | 49.911 |
| 0.9472800925925925 | 49.913 |
| 0.9472916666666666 | 49.914 |
| 0.9473032407407408 | 49.914 |
| 0.9473148148148148 | 49.916 |
| 0.9473263888888889 | 49.916 |
| 0.9473379629629629 | 49.918 |
| 0.9473495370370371 | 49.92 |
| 0.9473611111111112 | 49.92 |
| 0.9473726851851851 | 49.918 |
| 0.9473842592592593 | 49.919 |
| 0.9473958333333333 | 49.919 |
| 0.9474074074074075 | 49.919 |
| 0.9474189814814814 | 49.918 |
| 0.9474305555555556 | 49.918 |
| 0.9474421296296297 | 49.918 |
| 0.9474537037037036 | 49.916 |
| 0.9474652777777778 | 49.914 |
| 0.9474768518518518 | 49.91 |
| 0.947488425925926 | 49.908 |
| 0.9474999999999999 | 49.906 |
| 0.947511574074074 | 49.904 |
| 0.9475231481481482 | 49.902 |
| 0.9475347222222222 | 49.901 |
| 0.9475462962962963 | 49.899 |
| 0.9475578703703703 | 49.9 |
| 0.9475694444444445 | 49.901 |
| 0.9475810185185186 | 49.901 |
| 0.9475925925925925 | 49.902 |
| 0.9476041666666667 | 49.901 |
| 0.9476157407407407 | 49.9 |
| 0.9476273148148149 | 49.9 |
| 0.9476388888888888 | 49.9 |
| 0.947650462962963 | 49.899 |
| 0.9476620370370371 | 49.9 |
| 0.947673611111111 | 49.901 |
| 0.9476851851851852 | 49.902 |
| 0.9476967592592592 | 49.903 |
| 0.9477083333333334 | 49.903 |
| 0.9477199074074073 | 49.902 |
| 0.9477314814814815 | 49.901 |
| 0.9477430555555556 | 49.899 |
| 0.9477546296296296 | 49.898 |
| 0.9477662037037037 | 49.898 |
| 0.9477777777777777 | 49.897 |
| 0.9477893518518519 | 49.896 |
| 0.947800925925926 | 49.896 |
| 0.9478125 | 49.895 |
| 0.9478240740740741 | 49.895 |
| 0.9478356481481481 | 49.894 |
| 0.9478472222222223 | 49.893 |
| 0.9478587962962962 | 49.891 |
| 0.9478703703703704 | 49.889 |
| 0.9478819444444445 | 49.889 |
| 0.9478935185185186 | 49.892 |
| 0.9479050925925926 | 49.895 |
| 0.9479166666666666 | 49.897 |
| 0.9479282407407408 | 49.895 |
| 0.9479398148148147 | 49.893 |
| 0.9479513888888889 | 49.892 |
| 0.947962962962963 | 49.89 |
| 0.947974537037037 | 49.887 |
| 0.9479861111111111 | 49.886 |
| 0.9479976851851851 | 49.885 |
| 0.9480092592592593 | 49.884 |
| 0.9480208333333334 | 49.88 |
| 0.9480324074074074 | 49.877 |
| 0.9480439814814815 | 49.876 |
| 0.9480555555555555 | 49.877 |
| 0.9480671296296297 | 49.876 |
| 0.9480787037037036 | 49.877 |
| 0.9480902777777778 | 49.877 |
| 0.9481018518518519 | 49.876 |
| 0.948113425925926 | 49.877 |
| 0.948125 | 49.877 |
| 0.948136574074074 | 49.877 |
| 0.9481481481481482 | 49.875 |
| 0.9481597222222223 | 49.874 |
| 0.9481712962962963 | 49.874 |
| 0.9481828703703704 | 49.877 |
| 0.9481944444444445 | 49.883 |
| 0.9482060185185185 | 49.889 |
| 0.9482175925925925 | 49.895 |
| 0.9482291666666667 | 49.898 |
| 0.9482407407407408 | 49.9 |
| 0.9482523148148148 | 49.901 |
| 0.9482638888888889 | 49.902 |
| 0.948275462962963 | 49.904 |
| 0.9482870370370371 | 49.906 |
| 0.948298611111111 | 49.906 |
| 0.9483101851851852 | 49.904 |
| 0.9483217592592593 | 49.904 |
| 0.9483333333333334 | 49.905 |
| 0.9483449074074074 | 49.907 |
| 0.9483564814814814 | 49.907 |
| 0.9483680555555556 | 49.905 |
| 0.9483796296296297 | 49.907 |
| 0.9483912037037037 | 49.909 |
| 0.9484027777777778 | 49.91 |
| 0.9484143518518519 | 49.91 |
| 0.9484259259259259 | 49.906 |
| 0.9484374999999999 | 49.902 |
| 0.9484490740740741 | 49.901 |
| 0.9484606481481482 | 49.901 |
| 0.9484722222222222 | 49.901 |
| 0.9484837962962963 | 49.9 |
| 0.9484953703703703 | 49.9 |
| 0.9485069444444445 | 49.899 |
| 0.9485185185185184 | 49.899 |
| 0.9485300925925926 | 49.901 |
| 0.9485416666666667 | 49.903 |
| 0.9485532407407408 | 49.905 |
| 0.9485648148148148 | 49.908 |
| 0.9485763888888888 | 49.91 |
| 0.948587962962963 | 49.911 |
| 0.9485995370370371 | 49.912 |
| 0.9486111111111111 | 49.914 |
| 0.9486226851851852 | 49.915 |
| 0.9486342592592593 | 49.916 |
| 0.9486458333333333 | 49.917 |
| 0.9486574074074073 | 49.92 |
| 0.9486689814814815 | 49.921 |
| 0.9486805555555556 | 49.92 |
| 0.9486921296296296 | 49.92 |
| 0.9487037037037037 | 49.922 |
| 0.9487152777777778 | 49.922 |
| 0.9487268518518519 | 49.923 |
| 0.9487384259259258 | 49.924 |
| 0.94875 | 49.925 |
| 0.9487615740740741 | 49.926 |
| 0.9487731481481482 | 49.927 |
| 0.9487847222222222 | 49.926 |
| 0.9487962962962962 | 49.924 |
| 0.9488078703703704 | 49.923 |
| 0.9488194444444445 | 49.921 |
| 0.9488310185185185 | 49.918 |
| 0.9488425925925926 | 49.916 |
| 0.9488541666666667 | 49.915 |
| 0.9488657407407407 | 49.914 |
| 0.9488773148148147 | 49.912 |
| 0.9488888888888889 | 49.911 |
| 0.948900462962963 | 49.91 |
| 0.948912037037037 | 49.91 |
| 0.9489236111111111 | 49.911 |
| 0.9489351851851852 | 49.912 |
| 0.9489467592592593 | 49.911 |
| 0.9489583333333332 | 49.911 |
| 0.9489699074074074 | 49.913 |
| 0.9489814814814815 | 49.913 |
| 0.9489930555555556 | 49.913 |
| 0.9490046296296296 | 49.91 |
| 0.9490162037037037 | 49.91 |
| 0.9490277777777778 | 49.911 |
| 0.949039351851852 | 49.911 |
| 0.9490509259259259 | 49.911 |
| 0.9490625 | 49.912 |
| 0.9490740740740741 | 49.913 |
| 0.9490856481481481 | 49.913 |
| 0.9490972222222221 | 49.911 |
| 0.9491087962962963 | 49.911 |
| 0.9491203703703704 | 49.912 |
| 0.9491319444444444 | 49.913 |
| 0.9491435185185185 | 49.914 |
| 0.9491550925925926 | 49.913 |
| 0.9491666666666667 | 49.914 |
| 0.9491782407407406 | 49.915 |
| 0.9491898148148148 | 49.915 |
| 0.9492013888888889 | 49.914 |
| 0.949212962962963 | 49.915 |
| 0.949224537037037 | 49.915 |
| 0.9492361111111111 | 49.916 |
| 0.9492476851851852 | 49.915 |
| 0.9492592592592594 | 49.917 |
| 0.9492708333333333 | 49.92 |
| 0.9492824074074074 | 49.921 |
| 0.9492939814814815 | 49.923 |
| 0.9493055555555556 | 49.924 |
| 0.9493171296296296 | 49.925 |
| 0.9493287037037037 | 49.926 |
| 0.9493402777777779 | 49.927 |
| 0.9493518518518519 | 49.927 |
| 0.9493634259259259 | 49.927 |
| 0.949375 | 49.926 |
| 0.9493865740740741 | 49.925 |
| 0.949398148148148 | 49.923 |
| 0.9494097222222222 | 49.921 |
| 0.9494212962962963 | 49.919 |
| 0.9494328703703704 | 49.915 |
| 0.9494444444444444 | 49.912 |
| 0.9494560185185185 | 49.915 |
| 0.9494675925925926 | 49.918 |
| 0.9494791666666668 | 49.922 |
| 0.9494907407407407 | 49.926 |
| 0.9495023148148148 | 49.927 |
| 0.9495138888888889 | 49.929 |
| 0.949525462962963 | 49.929 |
| 0.949537037037037 | 49.93 |
| 0.9495486111111111 | 49.932 |
| 0.9495601851851853 | 49.933 |
| 0.9495717592592593 | 49.932 |
| 0.9495833333333333 | 49.93 |
| 0.9495949074074074 | 49.929 |
| 0.9496064814814815 | 49.928 |
| 0.9496180555555555 | 49.928 |
| 0.9496296296296296 | 49.928 |
| 0.9496412037037038 | 49.929 |
| 0.9496527777777778 | 49.928 |
| 0.9496643518518518 | 49.926 |
| 0.9496759259259259 | 49.925 |
| 0.9496875 | 49.924 |
| 0.9496990740740742 | 49.924 |
| 0.9497106481481481 | 49.925 |
| 0.9497222222222222 | 49.924 |
| 0.9497337962962963 | 49.923 |
| 0.9497453703703704 | 49.922 |
| 0.9497569444444444 | 49.919 |
| 0.9497685185185185 | 49.918 |
| 0.9497800925925927 | 49.916 |
| 0.9497916666666667 | 49.916 |
| 0.9498032407407407 | 49.916 |
| 0.9498148148148148 | 49.917 |
| 0.9498263888888889 | 49.916 |
| 0.9498379629629629 | 49.916 |
| 0.949849537037037 | 49.917 |
| 0.9498611111111112 | 49.916 |
| 0.9498726851851852 | 49.914 |
| 0.9498842592592592 | 49.913 |
| 0.9498958333333333 | 49.912 |
| 0.9499074074074074 | 49.911 |
| 0.9499189814814816 | 49.912 |
| 0.9499305555555555 | 49.911 |
| 0.9499421296296297 | 49.91 |
| 0.9499537037037037 | 49.912 |
| 0.9499652777777778 | 49.913 |
| 0.9499768518518518 | 49.914 |
| 0.9499884259259259 | 49.913 |
| 0.9500000000000001 | 49.913 |
| 0.9500115740740741 | 49.913 |
| 0.9500231481481481 | 49.91 |
| 0.9500347222222222 | 49.906 |
| 0.9500462962962963 | 49.901 |
| 0.9500578703703703 | 49.898 |
| 0.9500694444444444 | 49.896 |
| 0.9500810185185186 | 49.895 |
| 0.9500925925925926 | 49.895 |
| 0.9501041666666666 | 49.894 |
| 0.9501157407407407 | 49.894 |
| 0.9501273148148148 | 49.895 |
| 0.950138888888889 | 49.897 |
| 0.9501504629629629 | 49.898 |
| 0.950162037037037 | 49.9 |
| 0.9501736111111111 | 49.9 |
| 0.9501851851851852 | 49.902 |
| 0.9501967592592592 | 49.9 |
| 0.9502083333333333 | 49.9 |
| 0.9502199074074075 | 49.899 |
| 0.9502314814814815 | 49.897 |
| 0.9502430555555555 | 49.895 |
| 0.9502546296296296 | 49.896 |
| 0.9502662037037037 | 49.896 |
| 0.9502777777777777 | 49.896 |
| 0.9502893518518518 | 49.898 |
| 0.950300925925926 | 49.9 |
| 0.9503125 | 49.901 |
| 0.950324074074074 | 49.902 |
| 0.9503356481481481 | 49.904 |
| 0.9503472222222222 | 49.907 |
| 0.9503587962962964 | 49.907 |
| 0.9503703703703703 | 49.907 |
| 0.9503819444444445 | 49.908 |
| 0.9503935185185185 | 49.909 |
| 0.9504050925925926 | 49.911 |
| 0.9504166666666666 | 49.915 |
| 0.9504282407407407 | 49.917 |
| 0.9504398148148149 | 49.919 |
| 0.9504513888888889 | 49.919 |
| 0.950462962962963 | 49.921 |
| 0.950474537037037 | 49.922 |
| 0.9504861111111111 | 49.922 |
| 0.9504976851851853 | 49.922 |
| 0.9505092592592592 | 49.922 |
| 0.9505208333333334 | 49.924 |
| 0.9505324074074074 | 49.924 |
| 0.9505439814814814 | 49.925 |
| 0.9505555555555555 | 49.923 |
| 0.9505671296296296 | 49.924 |
| 0.9505787037037038 | 49.923 |
| 0.9505902777777777 | 49.925 |
| 0.9506018518518519 | 49.925 |
| 0.9506134259259259 | 49.924 |
| 0.950625 | 49.922 |
| 0.950636574074074 | 49.924 |
| 0.9506481481481481 | 49.925 |
| 0.9506597222222223 | 49.925 |
| 0.9506712962962963 | 49.923 |
| 0.9506828703703704 | 49.923 |
| 0.9506944444444444 | 49.923 |
| 0.9507060185185185 | 49.921 |
| 0.9507175925925927 | 49.921 |
| 0.9507291666666666 | 49.919 |
| 0.9507407407407408 | 49.916 |
| 0.9507523148148148 | 49.913 |
| 0.950763888888889 | 49.911 |
| 0.9507754629629629 | 49.909 |
| 0.950787037037037 | 49.908 |
| 0.9507986111111112 | 49.907 |
| 0.9508101851851851 | 49.907 |
| 0.9508217592592593 | 49.908 |
| 0.9508333333333333 | 49.911 |
| 0.9508449074074075 | 49.914 |
| 0.9508564814814814 | 49.913 |
| 0.9508680555555555 | 49.914 |
| 0.9508796296296297 | 49.915 |
| 0.9508912037037037 | 49.914 |
| 0.9509027777777778 | 49.915 |
| 0.9509143518518518 | 49.916 |
| 0.950925925925926 | 49.917 |
| 0.9509375000000001 | 49.918 |
| 0.950949074074074 | 49.919 |
| 0.9509606481481482 | 49.921 |
| 0.9509722222222222 | 49.923 |
| 0.9509837962962964 | 49.924 |
| 0.9509953703703703 | 49.927 |
| 0.9510069444444444 | 49.926 |
| 0.9510185185185186 | 49.925 |
| 0.9510300925925925 | 49.924 |
| 0.9510416666666667 | 49.925 |
| 0.9510532407407407 | 49.925 |
| 0.9510648148148149 | 49.926 |
| 0.9510763888888888 | 49.929 |
| 0.9510879629629629 | 49.93 |
| 0.9510995370370371 | 49.933 |
| 0.9511111111111111 | 49.934 |
| 0.9511226851851852 | 49.934 |
| 0.9511342592592592 | 49.934 |
| 0.9511458333333334 | 49.934 |
| 0.9511574074074075 | 49.932 |
| 0.9511689814814814 | 49.933 |
| 0.9511805555555556 | 49.932 |
| 0.9511921296296296 | 49.931 |
| 0.9512037037037038 | 49.931 |
| 0.9512152777777777 | 49.931 |
| 0.9512268518518519 | 49.933 |
| 0.951238425925926 | 49.936 |
| 0.9512499999999999 | 49.936 |
| 0.9512615740740741 | 49.936 |
| 0.9512731481481481 | 49.935 |
| 0.9512847222222223 | 49.938 |
| 0.9512962962962962 | 49.938 |
| 0.9513078703703703 | 49.937 |
| 0.9513194444444445 | 49.936 |
| 0.9513310185185185 | 49.935 |
| 0.9513425925925926 | 49.934 |
| 0.9513541666666666 | 49.93 |
| 0.9513657407407408 | 49.93 |
| 0.9513773148148149 | 49.93 |
| 0.9513888888888888 | 49.931 |
| 0.951400462962963 | 49.93 |
| 0.951412037037037 | 49.928 |
| 0.9514236111111112 | 49.924 |
| 0.9514351851851851 | 49.919 |
| 0.9514467592592593 | 49.919 |
| 0.9514583333333334 | 49.917 |
| 0.9514699074074073 | 49.915 |
| 0.9514814814814815 | 49.914 |
| 0.9514930555555555 | 49.913 |
| 0.9515046296296297 | 49.914 |
| 0.9515162037037036 | 49.917 |
| 0.9515277777777778 | 49.917 |
| 0.9515393518518519 | 49.917 |
| 0.9515509259259259 | 49.92 |
| 0.9515625 | 49.921 |
| 0.951574074074074 | 49.922 |
| 0.9515856481481482 | 49.923 |
| 0.9515972222222223 | 49.925 |
| 0.9516087962962962 | 49.925 |
| 0.9516203703703704 | 49.927 |
| 0.9516319444444444 | 49.927 |
| 0.9516435185185186 | 49.926 |
| 0.9516550925925925 | 49.926 |
| 0.9516666666666667 | 49.926 |
| 0.9516782407407408 | 49.926 |
| 0.9516898148148147 | 49.925 |
| 0.9517013888888889 | 49.924 |
| 0.9517129629629629 | 49.921 |
| 0.9517245370370371 | 49.92 |
| 0.951736111111111 | 49.919 |
| 0.9517476851851852 | 49.919 |
| 0.9517592592592593 | 49.92 |
| 0.9517708333333333 | 49.92 |
| 0.9517824074074074 | 49.92 |
| 0.9517939814814814 | 49.919 |
| 0.9518055555555556 | 49.92 |
| 0.9518171296296297 | 49.923 |
| 0.9518287037037036 | 49.926 |
| 0.9518402777777778 | 49.929 |
| 0.9518518518518518 | 49.93 |
| 0.951863425925926 | 49.932 |
| 0.9518749999999999 | 49.935 |
| 0.9518865740740741 | 49.934 |
| 0.9518981481481482 | 49.934 |
| 0.9519097222222223 | 49.932 |
| 0.9519212962962963 | 49.931 |
| 0.9519328703703703 | 49.93 |
| 0.9519444444444445 | 49.929 |
| 0.9519560185185186 | 49.927 |
| 0.9519675925925926 | 49.926 |
| 0.9519791666666667 | 49.926 |
| 0.9519907407407407 | 49.925 |
| 0.9520023148148148 | 49.923 |
| 0.9520138888888888 | 49.923 |
| 0.952025462962963 | 49.922 |
| 0.9520370370370371 | 49.921 |
| 0.952048611111111 | 49.921 |
| 0.9520601851851852 | 49.922 |
| 0.9520717592592592 | 49.921 |
| 0.9520833333333334 | 49.921 |
| 0.9520949074074073 | 49.92 |
| 0.9521064814814815 | 49.921 |
| 0.9521180555555556 | 49.92 |
| 0.9521296296296297 | 49.921 |
| 0.9521412037037037 | 49.921 |
| 0.9521527777777777 | 49.921 |
| 0.9521643518518519 | 49.923 |
| 0.952175925925926 | 49.921 |
| 0.9521875 | 49.92 |
| 0.9521990740740741 | 49.921 |
| 0.9522106481481482 | 49.922 |
| 0.9522222222222222 | 49.923 |
| 0.9522337962962962 | 49.925 |
| 0.9522453703703704 | 49.925 |
| 0.9522569444444445 | 49.927 |
| 0.9522685185185185 | 49.925 |
| 0.9522800925925926 | 49.925 |
| 0.9522916666666666 | 49.924 |
| 0.9523032407407408 | 49.925 |
| 0.9523148148148147 | 49.927 |
| 0.9523263888888889 | 49.93 |
| 0.952337962962963 | 49.931 |
| 0.9523495370370371 | 49.933 |
| 0.9523611111111111 | 49.934 |
| 0.9523726851851851 | 49.933 |
| 0.9523842592592593 | 49.933 |
| 0.9523958333333334 | 49.931 |
| 0.9524074074074074 | 49.93 |
| 0.9524189814814815 | 49.927 |
| 0.9524305555555556 | 49.927 |
| 0.9524421296296296 | 49.926 |
| 0.9524537037037036 | 49.925 |
| 0.9524652777777778 | 49.924 |
| 0.9524768518518519 | 49.924 |
| 0.9524884259259259 | 49.924 |
| 0.9525 | 49.923 |
| 0.952511574074074 | 49.922 |
| 0.9525231481481482 | 49.921 |
| 0.9525347222222221 | 49.919 |
| 0.9525462962962963 | 49.918 |
| 0.9525578703703704 | 49.914 |
| 0.9525694444444445 | 49.911 |
| 0.9525810185185185 | 49.909 |
| 0.9525925925925925 | 49.908 |
| 0.9526041666666667 | 49.909 |
| 0.9526157407407408 | 49.91 |
| 0.9526273148148148 | 49.912 |
| 0.9526388888888889 | 49.914 |
| 0.952650462962963 | 49.916 |
| 0.952662037037037 | 49.918 |
| 0.952673611111111 | 49.919 |
| 0.9526851851851852 | 49.92 |
| 0.9526967592592593 | 49.92 |
| 0.9527083333333333 | 49.919 |
| 0.9527199074074074 | 49.917 |
| 0.9527314814814815 | 49.917 |
| 0.9527430555555556 | 49.917 |
| 0.9527546296296295 | 49.919 |
| 0.9527662037037037 | 49.919 |
| 0.9527777777777778 | 49.92 |
| 0.9527893518518519 | 49.92 |
| 0.9528009259259259 | 49.921 |
| 0.9528125 | 49.921 |
| 0.9528240740740741 | 49.92 |
| 0.9528356481481483 | 49.919 |
| 0.9528472222222222 | 49.917 |
| 0.9528587962962963 | 49.917 |
| 0.9528703703703704 | 49.916 |
| 0.9528819444444444 | 49.916 |
| 0.9528935185185184 | 49.914 |
| 0.9529050925925926 | 49.915 |
| 0.9529166666666667 | 49.912 |
| 0.9529282407407407 | 49.911 |
| 0.9529398148148148 | 49.909 |
| 0.9529513888888889 | 49.905 |
| 0.952962962962963 | 49.903 |
| 0.9529745370370369 | 49.902 |
| 0.9529861111111111 | 49.902 |
| 0.9529976851851852 | 49.903 |
| 0.9530092592592593 | 49.903 |
| 0.9530208333333333 | 49.904 |
| 0.9530324074074074 | 49.906 |
| 0.9530439814814815 | 49.907 |
| 0.9530555555555557 | 49.908 |
| 0.9530671296296296 | 49.911 |
| 0.9530787037037037 | 49.912 |
| 0.9530902777777778 | 49.911 |
| 0.9531018518518519 | 49.91 |
| 0.9531134259259259 | 49.911 |
| 0.953125 | 49.911 |
| 0.9531365740740741 | 49.911 |
| 0.9531481481481481 | 49.911 |
| 0.9531597222222222 | 49.912 |
| 0.9531712962962963 | 49.914 |
| 0.9531828703703704 | 49.914 |
| 0.9531944444444443 | 49.913 |
| 0.9532060185185185 | 49.914 |
| 0.9532175925925926 | 49.916 |
| 0.9532291666666667 | 49.918 |
| 0.9532407407407407 | 49.919 |
| 0.9532523148148148 | 49.92 |
| 0.9532638888888889 | 49.922 |
| 0.9532754629629631 | 49.924 |
| 0.953287037037037 | 49.925 |
| 0.9532986111111111 | 49.926 |
| 0.9533101851851852 | 49.926 |
| 0.9533217592592593 | 49.927 |
| 0.9533333333333333 | 49.927 |
| 0.9533449074074074 | 49.929 |
| 0.9533564814814816 | 49.929 |
| 0.9533680555555556 | 49.929 |
| 0.9533796296296296 | 49.928 |
| 0.9533912037037037 | 49.927 |
| 0.9534027777777778 | 49.926 |
| 0.9534143518518517 | 49.925 |
| 0.9534259259259259 | 49.925 |
| 0.9534375 | 49.924 |
| 0.9534490740740741 | 49.924 |
| 0.9534606481481481 | 49.922 |
| 0.9534722222222222 | 49.921 |
| 0.9534837962962963 | 49.919 |
| 0.9534953703703705 | 49.918 |
| 0.9535069444444444 | 49.916 |
| 0.9535185185185185 | 49.916 |
| 0.9535300925925926 | 49.916 |
| 0.9535416666666667 | 49.916 |
| 0.9535532407407407 | 49.918 |
| 0.9535648148148148 | 49.92 |
| 0.953576388888889 | 49.921 |
| 0.953587962962963 | 49.921 |
| 0.953599537037037 | 49.92 |
| 0.9536111111111111 | 49.921 |
| 0.9536226851851852 | 49.924 |
| 0.9536342592592592 | 49.923 |
| 0.9536458333333333 | 49.923 |
| 0.9536574074074075 | 49.924 |
| 0.9536689814814815 | 49.921 |
| 0.9536805555555555 | 49.919 |
| 0.9536921296296296 | 49.916 |
| 0.9537037037037037 | 49.914 |
| 0.9537152777777779 | 49.912 |
| 0.9537268518518518 | 49.912 |
| 0.953738425925926 | 49.912 |
| 0.95375 | 49.911 |
| 0.9537615740740741 | 49.909 |
| 0.9537731481481481 | 49.909 |
| 0.9537847222222222 | 49.909 |
| 0.9537962962962964 | 49.908 |
| 0.9538078703703704 | 49.907 |
| 0.9538194444444444 | 49.909 |
| 0.9538310185185185 | 49.909 |
| 0.9538425925925926 | 49.908 |
| 0.9538541666666666 | 49.908 |
| 0.9538657407407407 | 49.907 |
| 0.9538773148148149 | 49.908 |
| 0.9538888888888889 | 49.91 |
| 0.9539004629629629 | 49.914 |
| 0.953912037037037 | 49.917 |
| 0.9539236111111111 | 49.919 |
| 0.9539351851851853 | 49.92 |
| 0.9539467592592592 | 49.923 |
| 0.9539583333333334 | 49.925 |
| 0.9539699074074074 | 49.925 |
| 0.9539814814814815 | 49.921 |
| 0.9539930555555555 | 49.918 |
| 0.9540046296296296 | 49.917 |
| 0.9540162037037038 | 49.917 |
| 0.9540277777777778 | 49.917 |
| 0.9540393518518518 | 49.918 |
| 0.9540509259259259 | 49.92 |
| 0.9540625 | 49.919 |
| 0.954074074074074 | 49.921 |
| 0.9540856481481481 | 49.921 |
| 0.9540972222222223 | 49.921 |
| 0.9541087962962963 | 49.921 |
| 0.9541203703703703 | 49.92 |
| 0.9541319444444444 | 49.919 |
| 0.9541435185185185 | 49.918 |
| 0.9541550925925927 | 49.916 |
| 0.9541666666666666 | 49.914 |
| 0.9541782407407408 | 49.913 |
| 0.9541898148148148 | 49.911 |
| 0.954201388888889 | 49.911 |
| 0.9542129629629629 | 49.91 |
| 0.954224537037037 | 49.911 |
| 0.9542361111111112 | 49.91 |
| 0.9542476851851852 | 49.91 |
| 0.9542592592592593 | 49.911 |
| 0.9542708333333333 | 49.912 |
| 0.9542824074074074 | 49.913 |
| 0.9542939814814814 | 49.912 |
| 0.9543055555555555 | 49.913 |
| 0.9543171296296297 | 49.912 |
| 0.9543287037037037 | 49.913 |
| 0.9543402777777777 | 49.914 |
| 0.9543518518518518 | 49.914 |
| 0.9543634259259259 | 49.915 |
| 0.9543750000000001 | 49.915 |
| 0.954386574074074 | 49.914 |
| 0.9543981481481482 | 49.916 |
| 0.9544097222222222 | 49.917 |
| 0.9544212962962964 | 49.916 |
| 0.9544328703703703 | 49.916 |
| 0.9544444444444444 | 49.918 |
| 0.9544560185185186 | 49.921 |
| 0.9544675925925926 | 49.923 |
| 0.9544791666666667 | 49.924 |
| 0.9544907407407407 | 49.925 |
| 0.9545023148148148 | 49.926 |
| 0.954513888888889 | 49.926 |
| 0.9545254629629629 | 49.929 |
| 0.9545370370370371 | 49.929 |
| 0.9545486111111111 | 49.929 |
| 0.9545601851851853 | 49.929 |
| 0.9545717592592592 | 49.928 |
| 0.9545833333333333 | 49.927 |
| 0.9545949074074075 | 49.927 |
| 0.9546064814814814 | 49.927 |
| 0.9546180555555556 | 49.927 |
| 0.9546296296296296 | 49.926 |
| 0.9546412037037038 | 49.926 |
| 0.9546527777777777 | 49.924 |
| 0.9546643518518518 | 49.923 |
| 0.954675925925926 | 49.924 |
| 0.9546875 | 49.925 |
| 0.9546990740740741 | 49.924 |
| 0.9547106481481481 | 49.925 |
| 0.9547222222222222 | 49.924 |
| 0.9547337962962964 | 49.926 |
| 0.9547453703703703 | 49.929 |
| 0.9547569444444445 | 49.932 |
| 0.9547685185185185 | 49.932 |
| 0.9547800925925927 | 49.933 |
| 0.9547916666666666 | 49.932 |
| 0.9548032407407407 | 49.931 |
| 0.9548148148148149 | 49.931 |
| 0.9548263888888888 | 49.929 |
| 0.954837962962963 | 49.928 |
| 0.954849537037037 | 49.927 |
| 0.9548611111111112 | 49.926 |
| 0.9548726851851851 | 49.927 |
| 0.9548842592592592 | 49.926 |
| 0.9548958333333334 | 49.925 |
| 0.9549074074074074 | 49.925 |
| 0.9549189814814815 | 49.926 |
| 0.9549305555555555 | 49.926 |
| 0.9549421296296297 | 49.926 |
| 0.9549537037037038 | 49.926 |
| 0.9549652777777777 | 49.928 |
| 0.9549768518518519 | 49.93 |
| 0.9549884259259259 | 49.931 |
| 0.9550000000000001 | 49.931 |
| 0.955011574074074 | 49.932 |
| 0.9550231481481481 | 49.932 |
| 0.9550347222222223 | 49.932 |
| 0.9550462962962962 | 49.933 |
| 0.9550578703703704 | 49.933 |
| 0.9550694444444444 | 49.934 |
| 0.9550810185185186 | 49.934 |
| 0.9550925925925925 | 49.934 |
| 0.9551041666666666 | 49.934 |
| 0.9551157407407408 | 49.933 |
| 0.9551273148148148 | 49.934 |
| 0.9551388888888889 | 49.935 |
| 0.9551504629629629 | 49.937 |
| 0.9551620370370371 | 49.941 |
| 0.9551736111111112 | 49.941 |
| 0.9551851851851851 | 49.944 |
| 0.9551967592592593 | 49.944 |
| 0.9552083333333333 | 49.943 |
| 0.9552199074074075 | 49.942 |
| 0.9552314814814814 | 49.941 |
| 0.9552430555555556 | 49.939 |
| 0.9552546296296297 | 49.936 |
| 0.9552662037037036 | 49.934 |
| 0.9552777777777778 | 49.934 |
| 0.9552893518518518 | 49.935 |
| 0.955300925925926 | 49.938 |
| 0.9553124999999999 | 49.941 |
| 0.955324074074074 | 49.943 |
| 0.9553356481481482 | 49.945 |
| 0.9553472222222222 | 49.946 |
| 0.9553587962962963 | 49.948 |
| 0.9553703703703703 | 49.949 |
| 0.9553819444444445 | 49.948 |
| 0.9553935185185186 | 49.947 |
| 0.9554050925925925 | 49.945 |
| 0.9554166666666667 | 49.945 |
| 0.9554282407407407 | 49.946 |
| 0.9554398148148149 | 49.949 |
| 0.9554513888888888 | 49.953 |
| 0.955462962962963 | 49.957 |
| 0.9554745370370371 | 49.96 |
| 0.955486111111111 | 49.962 |
| 0.9554976851851852 | 49.962 |
| 0.9555092592592592 | 49.961 |
| 0.9555208333333334 | 49.959 |
| 0.9555324074074073 | 49.958 |
| 0.9555439814814815 | 49.955 |
| 0.9555555555555556 | 49.952 |
| 0.9555671296296296 | 49.95 |
| 0.9555787037037037 | 49.949 |
| 0.9555902777777777 | 49.947 |
| 0.9556018518518519 | 49.947 |
| 0.955613425925926 | 49.947 |
| 0.955625 | 49.95 |
| 0.9556365740740741 | 49.953 |
| 0.9556481481481481 | 49.956 |
| 0.9556597222222223 | 49.959 |
| 0.9556712962962962 | 49.962 |
| 0.9556828703703704 | 49.965 |
| 0.9556944444444445 | 49.967 |
| 0.9557060185185186 | 49.967 |
| 0.9557175925925926 | 49.966 |
| 0.9557291666666666 | 49.963 |
| 0.9557407407407408 | 49.963 |
| 0.9557523148148147 | 49.963 |
| 0.9557638888888889 | 49.963 |
| 0.955775462962963 | 49.964 |
| 0.955787037037037 | 49.965 |
| 0.9557986111111111 | 49.966 |
| 0.9558101851851851 | 49.968 |
| 0.9558217592592593 | 49.97 |
| 0.9558333333333334 | 49.972 |
| 0.9558449074074074 | 49.974 |
| 0.9558564814814815 | 49.975 |
| 0.9558680555555555 | 49.976 |
| 0.9558796296296297 | 49.976 |
| 0.9558912037037036 | 49.974 |
| 0.9559027777777778 | 49.975 |
| 0.9559143518518519 | 49.975 |
| 0.955925925925926 | 49.975 |
| 0.9559375 | 49.974 |
| 0.955949074074074 | 49.974 |
| 0.9559606481481482 | 49.973 |
| 0.9559722222222223 | 49.973 |
| 0.9559837962962963 | 49.974 |
| 0.9559953703703704 | 49.975 |
| 0.9560069444444445 | 49.975 |
| 0.9560185185185185 | 49.976 |
| 0.9560300925925925 | 49.978 |
| 0.9560416666666667 | 49.978 |
| 0.9560532407407408 | 49.979 |
| 0.9560648148148148 | 49.979 |
| 0.9560763888888889 | 49.98 |
| 0.956087962962963 | 49.98 |
| 0.9560995370370371 | 49.98 |
| 0.956111111111111 | 49.98 |
| 0.9561226851851852 | 49.98 |
| 0.9561342592592593 | 49.979 |
| 0.9561458333333334 | 49.98 |
| 0.9561574074074074 | 49.981 |
| 0.9561689814814814 | 49.98 |
| 0.9561805555555556 | 49.98 |
| 0.9561921296296297 | 49.979 |
| 0.9562037037037037 | 49.978 |
| 0.9562152777777778 | 49.977 |
| 0.9562268518518519 | 49.975 |
| 0.9562384259259259 | 49.973 |
| 0.9562499999999999 | 49.971 |
| 0.9562615740740741 | 49.969 |
| 0.9562731481481482 | 49.968 |
| 0.9562847222222222 | 49.968 |
| 0.9562962962962963 | 49.969 |
| 0.9563078703703703 | 49.97 |
| 0.9563194444444445 | 49.973 |
| 0.9563310185185184 | 49.975 |
| 0.9563425925925926 | 49.976 |
| 0.9563541666666667 | 49.975 |
| 0.9563657407407408 | 49.975 |
| 0.9563773148148148 | 49.975 |
| 0.9563888888888888 | 49.975 |
| 0.956400462962963 | 49.974 |
| 0.9564120370370371 | 49.972 |
| 0.9564236111111111 | 49.971 |
| 0.9564351851851852 | 49.97 |
| 0.9564467592592593 | 49.97 |
| 0.9564583333333333 | 49.97 |
| 0.9564699074074073 | 49.969 |
| 0.9564814814814815 | 49.968 |
| 0.9564930555555556 | 49.966 |
| 0.9565046296296296 | 49.964 |
| 0.9565162037037037 | 49.964 |
| 0.9565277777777778 | 49.962 |
| 0.9565393518518519 | 49.963 |
| 0.9565509259259258 | 49.964 |
| 0.9565625 | 49.965 |
| 0.9565740740740741 | 49.966 |
| 0.9565856481481482 | 49.968 |
| 0.9565972222222222 | 49.971 |
| 0.9566087962962962 | 49.972 |
| 0.9566203703703704 | 49.974 |
| 0.9566319444444445 | 49.973 |
| 0.9566435185185185 | 49.972 |
| 0.9566550925925926 | 49.973 |
| 0.9566666666666667 | 49.971 |
| 0.9566782407407407 | 49.97 |
| 0.9566898148148147 | 49.967 |
| 0.9567013888888889 | 49.965 |
| 0.956712962962963 | 49.964 |
| 0.956724537037037 | 49.966 |
| 0.9567361111111111 | 49.969 |
| 0.9567476851851852 | 49.97 |
| 0.9567592592592593 | 49.972 |
| 0.9567708333333332 | 49.973 |
| 0.9567824074074074 | 49.973 |
| 0.9567939814814815 | 49.972 |
| 0.9568055555555556 | 49.969 |
| 0.9568171296296296 | 49.967 |
| 0.9568287037037037 | 49.965 |
| 0.9568402777777778 | 49.964 |
| 0.956851851851852 | 49.964 |
| 0.9568634259259259 | 49.966 |
| 0.956875 | 49.968 |
| 0.9568865740740741 | 49.97 |
| 0.9568981481481481 | 49.972 |
| 0.9569097222222221 | 49.975 |
| 0.9569212962962963 | 49.977 |
| 0.9569328703703704 | 49.979 |
| 0.9569444444444444 | 49.981 |
| 0.9569560185185185 | 49.982 |
| 0.9569675925925926 | 49.982 |
| 0.9569791666666667 | 49.982 |
| 0.9569907407407406 | 49.982 |
| 0.9570023148148148 | 49.982 |
| 0.9570138888888889 | 49.984 |
| 0.957025462962963 | 49.984 |
| 0.957037037037037 | 49.985 |
| 0.9570486111111111 | 49.987 |
| 0.9570601851851852 | 49.989 |
| 0.9570717592592594 | 49.989 |
| 0.9570833333333333 | 49.988 |
| 0.9570949074074074 | 49.988 |
| 0.9571064814814815 | 49.987 |
| 0.9571180555555556 | 49.988 |
| 0.9571296296296296 | 49.989 |
| 0.9571412037037037 | 49.988 |
| 0.9571527777777779 | 49.987 |
| 0.9571643518518519 | 49.986 |
| 0.9571759259259259 | 49.986 |
| 0.9571875 | 49.986 |
| 0.9571990740740741 | 49.985 |
| 0.957210648148148 | 49.984 |
| 0.9572222222222222 | 49.982 |
| 0.9572337962962963 | 49.981 |
| 0.9572453703703704 | 49.981 |
| 0.9572569444444444 | 49.98 |
| 0.9572685185185185 | 49.979 |
| 0.9572800925925926 | 49.98 |
| 0.9572916666666668 | 49.982 |
| 0.9573032407407407 | 49.985 |
| 0.9573148148148148 | 49.987 |
| 0.9573263888888889 | 49.99 |
| 0.957337962962963 | 49.993 |
| 0.957349537037037 | 49.997 |
| 0.9573611111111111 | 50.001 |
| 0.9573726851851853 | 50.004 |
| 0.9573842592592593 | 50.006 |
| 0.9573958333333333 | 50.006 |
| 0.9574074074074074 | 50.004 |
| 0.9574189814814815 | 50.002 |
| 0.9574305555555555 | 50.002 |
| 0.9574421296296296 | 50.002 |
| 0.9574537037037038 | 50.001 |
| 0.9574652777777778 | 50.001 |
| 0.9574768518518518 | 50.001 |
| 0.9574884259259259 | 50.002 |
| 0.9575 | 50.001 |
| 0.9575115740740742 | 50.001 |
| 0.9575231481481481 | 50.003 |
| 0.9575347222222222 | 50.005 |
| 0.9575462962962963 | 50.006 |
| 0.9575578703703704 | 50.007 |
| 0.9575694444444444 | 50.008 |
| 0.9575810185185185 | 50.009 |
| 0.9575925925925927 | 50.012 |
| 0.9576041666666667 | 50.017 |
| 0.9576157407407407 | 50.022 |
| 0.9576273148148148 | 50.026 |